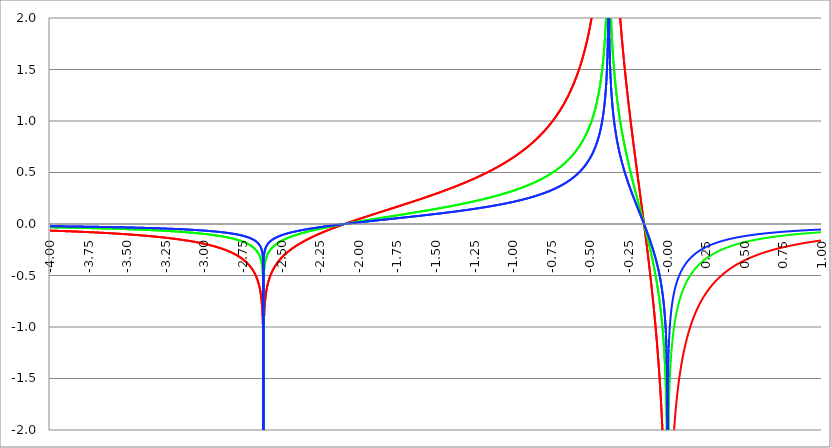
| Category | Series 1 | Series 0 | Series 2 |
|---|---|---|---|
| -4.0 | -0.064 | -0.032 | -0.021 |
| -3.9975 | -0.064 | -0.032 | -0.021 |
| -3.995 | -0.064 | -0.032 | -0.021 |
| -3.9925 | -0.064 | -0.032 | -0.021 |
| -3.99 | -0.065 | -0.032 | -0.022 |
| -3.9875 | -0.065 | -0.032 | -0.022 |
| -3.985 | -0.065 | -0.032 | -0.022 |
| -3.9825 | -0.065 | -0.032 | -0.022 |
| -3.98 | -0.065 | -0.033 | -0.022 |
| -3.9775 | -0.065 | -0.033 | -0.022 |
| -3.975000000000001 | -0.065 | -0.033 | -0.022 |
| -3.972500000000001 | -0.065 | -0.033 | -0.022 |
| -3.970000000000001 | -0.066 | -0.033 | -0.022 |
| -3.967500000000001 | -0.066 | -0.033 | -0.022 |
| -3.965000000000001 | -0.066 | -0.033 | -0.022 |
| -3.962500000000001 | -0.066 | -0.033 | -0.022 |
| -3.960000000000001 | -0.066 | -0.033 | -0.022 |
| -3.957500000000001 | -0.066 | -0.033 | -0.022 |
| -3.955000000000001 | -0.066 | -0.033 | -0.022 |
| -3.952500000000001 | -0.066 | -0.033 | -0.022 |
| -3.950000000000001 | -0.067 | -0.033 | -0.022 |
| -3.947500000000001 | -0.067 | -0.033 | -0.022 |
| -3.945000000000001 | -0.067 | -0.033 | -0.022 |
| -3.942500000000001 | -0.067 | -0.034 | -0.022 |
| -3.940000000000001 | -0.067 | -0.034 | -0.022 |
| -3.937500000000001 | -0.067 | -0.034 | -0.022 |
| -3.935000000000001 | -0.067 | -0.034 | -0.022 |
| -3.932500000000001 | -0.068 | -0.034 | -0.023 |
| -3.930000000000001 | -0.068 | -0.034 | -0.023 |
| -3.927500000000002 | -0.068 | -0.034 | -0.023 |
| -3.925000000000002 | -0.068 | -0.034 | -0.023 |
| -3.922500000000002 | -0.068 | -0.034 | -0.023 |
| -3.920000000000002 | -0.068 | -0.034 | -0.023 |
| -3.917500000000002 | -0.068 | -0.034 | -0.023 |
| -3.915000000000002 | -0.069 | -0.034 | -0.023 |
| -3.912500000000002 | -0.069 | -0.034 | -0.023 |
| -3.910000000000002 | -0.069 | -0.034 | -0.023 |
| -3.907500000000002 | -0.069 | -0.034 | -0.023 |
| -3.905000000000002 | -0.069 | -0.035 | -0.023 |
| -3.902500000000002 | -0.069 | -0.035 | -0.023 |
| -3.900000000000002 | -0.069 | -0.035 | -0.023 |
| -3.897500000000002 | -0.07 | -0.035 | -0.023 |
| -3.895000000000002 | -0.07 | -0.035 | -0.023 |
| -3.892500000000002 | -0.07 | -0.035 | -0.023 |
| -3.890000000000002 | -0.07 | -0.035 | -0.023 |
| -3.887500000000002 | -0.07 | -0.035 | -0.023 |
| -3.885000000000002 | -0.07 | -0.035 | -0.023 |
| -3.882500000000002 | -0.07 | -0.035 | -0.023 |
| -3.880000000000002 | -0.071 | -0.035 | -0.024 |
| -3.877500000000003 | -0.071 | -0.035 | -0.024 |
| -3.875000000000003 | -0.071 | -0.035 | -0.024 |
| -3.872500000000003 | -0.071 | -0.035 | -0.024 |
| -3.870000000000003 | -0.071 | -0.036 | -0.024 |
| -3.867500000000003 | -0.071 | -0.036 | -0.024 |
| -3.865000000000003 | -0.071 | -0.036 | -0.024 |
| -3.862500000000003 | -0.072 | -0.036 | -0.024 |
| -3.860000000000003 | -0.072 | -0.036 | -0.024 |
| -3.857500000000003 | -0.072 | -0.036 | -0.024 |
| -3.855000000000003 | -0.072 | -0.036 | -0.024 |
| -3.852500000000003 | -0.072 | -0.036 | -0.024 |
| -3.850000000000003 | -0.072 | -0.036 | -0.024 |
| -3.847500000000003 | -0.072 | -0.036 | -0.024 |
| -3.845000000000003 | -0.073 | -0.036 | -0.024 |
| -3.842500000000003 | -0.073 | -0.036 | -0.024 |
| -3.840000000000003 | -0.073 | -0.036 | -0.024 |
| -3.837500000000003 | -0.073 | -0.037 | -0.024 |
| -3.835000000000003 | -0.073 | -0.037 | -0.024 |
| -3.832500000000004 | -0.073 | -0.037 | -0.024 |
| -3.830000000000004 | -0.074 | -0.037 | -0.025 |
| -3.827500000000004 | -0.074 | -0.037 | -0.025 |
| -3.825000000000004 | -0.074 | -0.037 | -0.025 |
| -3.822500000000004 | -0.074 | -0.037 | -0.025 |
| -3.820000000000004 | -0.074 | -0.037 | -0.025 |
| -3.817500000000004 | -0.074 | -0.037 | -0.025 |
| -3.815000000000004 | -0.074 | -0.037 | -0.025 |
| -3.812500000000004 | -0.075 | -0.037 | -0.025 |
| -3.810000000000004 | -0.075 | -0.037 | -0.025 |
| -3.807500000000004 | -0.075 | -0.037 | -0.025 |
| -3.805000000000004 | -0.075 | -0.038 | -0.025 |
| -3.802500000000004 | -0.075 | -0.038 | -0.025 |
| -3.800000000000004 | -0.075 | -0.038 | -0.025 |
| -3.797500000000004 | -0.076 | -0.038 | -0.025 |
| -3.795000000000004 | -0.076 | -0.038 | -0.025 |
| -3.792500000000004 | -0.076 | -0.038 | -0.025 |
| -3.790000000000004 | -0.076 | -0.038 | -0.025 |
| -3.787500000000004 | -0.076 | -0.038 | -0.025 |
| -3.785000000000004 | -0.076 | -0.038 | -0.025 |
| -3.782500000000005 | -0.077 | -0.038 | -0.026 |
| -3.780000000000005 | -0.077 | -0.038 | -0.026 |
| -3.777500000000005 | -0.077 | -0.038 | -0.026 |
| -3.775000000000005 | -0.077 | -0.039 | -0.026 |
| -3.772500000000005 | -0.077 | -0.039 | -0.026 |
| -3.770000000000005 | -0.077 | -0.039 | -0.026 |
| -3.767500000000005 | -0.078 | -0.039 | -0.026 |
| -3.765000000000005 | -0.078 | -0.039 | -0.026 |
| -3.762500000000005 | -0.078 | -0.039 | -0.026 |
| -3.760000000000005 | -0.078 | -0.039 | -0.026 |
| -3.757500000000005 | -0.078 | -0.039 | -0.026 |
| -3.755000000000005 | -0.078 | -0.039 | -0.026 |
| -3.752500000000005 | -0.079 | -0.039 | -0.026 |
| -3.750000000000005 | -0.079 | -0.039 | -0.026 |
| -3.747500000000005 | -0.079 | -0.04 | -0.026 |
| -3.745000000000005 | -0.079 | -0.04 | -0.026 |
| -3.742500000000005 | -0.079 | -0.04 | -0.026 |
| -3.740000000000005 | -0.08 | -0.04 | -0.027 |
| -3.737500000000006 | -0.08 | -0.04 | -0.027 |
| -3.735000000000006 | -0.08 | -0.04 | -0.027 |
| -3.732500000000006 | -0.08 | -0.04 | -0.027 |
| -3.730000000000006 | -0.08 | -0.04 | -0.027 |
| -3.727500000000006 | -0.08 | -0.04 | -0.027 |
| -3.725000000000006 | -0.081 | -0.04 | -0.027 |
| -3.722500000000006 | -0.081 | -0.04 | -0.027 |
| -3.720000000000006 | -0.081 | -0.04 | -0.027 |
| -3.717500000000006 | -0.081 | -0.041 | -0.027 |
| -3.715000000000006 | -0.081 | -0.041 | -0.027 |
| -3.712500000000006 | -0.082 | -0.041 | -0.027 |
| -3.710000000000006 | -0.082 | -0.041 | -0.027 |
| -3.707500000000006 | -0.082 | -0.041 | -0.027 |
| -3.705000000000006 | -0.082 | -0.041 | -0.027 |
| -3.702500000000006 | -0.082 | -0.041 | -0.027 |
| -3.700000000000006 | -0.082 | -0.041 | -0.027 |
| -3.697500000000006 | -0.083 | -0.041 | -0.028 |
| -3.695000000000006 | -0.083 | -0.041 | -0.028 |
| -3.692500000000006 | -0.083 | -0.042 | -0.028 |
| -3.690000000000006 | -0.083 | -0.042 | -0.028 |
| -3.687500000000006 | -0.083 | -0.042 | -0.028 |
| -3.685000000000007 | -0.084 | -0.042 | -0.028 |
| -3.682500000000007 | -0.084 | -0.042 | -0.028 |
| -3.680000000000007 | -0.084 | -0.042 | -0.028 |
| -3.677500000000007 | -0.084 | -0.042 | -0.028 |
| -3.675000000000007 | -0.084 | -0.042 | -0.028 |
| -3.672500000000007 | -0.085 | -0.042 | -0.028 |
| -3.670000000000007 | -0.085 | -0.042 | -0.028 |
| -3.667500000000007 | -0.085 | -0.042 | -0.028 |
| -3.665000000000007 | -0.085 | -0.043 | -0.028 |
| -3.662500000000007 | -0.085 | -0.043 | -0.028 |
| -3.660000000000007 | -0.086 | -0.043 | -0.029 |
| -3.657500000000007 | -0.086 | -0.043 | -0.029 |
| -3.655000000000007 | -0.086 | -0.043 | -0.029 |
| -3.652500000000007 | -0.086 | -0.043 | -0.029 |
| -3.650000000000007 | -0.086 | -0.043 | -0.029 |
| -3.647500000000007 | -0.087 | -0.043 | -0.029 |
| -3.645000000000007 | -0.087 | -0.043 | -0.029 |
| -3.642500000000008 | -0.087 | -0.043 | -0.029 |
| -3.640000000000008 | -0.087 | -0.044 | -0.029 |
| -3.637500000000008 | -0.087 | -0.044 | -0.029 |
| -3.635000000000008 | -0.088 | -0.044 | -0.029 |
| -3.632500000000008 | -0.088 | -0.044 | -0.029 |
| -3.630000000000008 | -0.088 | -0.044 | -0.029 |
| -3.627500000000008 | -0.088 | -0.044 | -0.029 |
| -3.625000000000008 | -0.088 | -0.044 | -0.029 |
| -3.622500000000008 | -0.089 | -0.044 | -0.03 |
| -3.620000000000008 | -0.089 | -0.044 | -0.03 |
| -3.617500000000008 | -0.089 | -0.045 | -0.03 |
| -3.615000000000008 | -0.089 | -0.045 | -0.03 |
| -3.612500000000008 | -0.09 | -0.045 | -0.03 |
| -3.610000000000008 | -0.09 | -0.045 | -0.03 |
| -3.607500000000008 | -0.09 | -0.045 | -0.03 |
| -3.605000000000008 | -0.09 | -0.045 | -0.03 |
| -3.602500000000008 | -0.09 | -0.045 | -0.03 |
| -3.600000000000008 | -0.091 | -0.045 | -0.03 |
| -3.597500000000009 | -0.091 | -0.045 | -0.03 |
| -3.595000000000009 | -0.091 | -0.046 | -0.03 |
| -3.592500000000009 | -0.091 | -0.046 | -0.03 |
| -3.590000000000009 | -0.091 | -0.046 | -0.03 |
| -3.587500000000009 | -0.092 | -0.046 | -0.031 |
| -3.585000000000009 | -0.092 | -0.046 | -0.031 |
| -3.582500000000009 | -0.092 | -0.046 | -0.031 |
| -3.580000000000009 | -0.092 | -0.046 | -0.031 |
| -3.577500000000009 | -0.093 | -0.046 | -0.031 |
| -3.575000000000009 | -0.093 | -0.046 | -0.031 |
| -3.572500000000009 | -0.093 | -0.047 | -0.031 |
| -3.570000000000009 | -0.093 | -0.047 | -0.031 |
| -3.56750000000001 | -0.094 | -0.047 | -0.031 |
| -3.565000000000009 | -0.094 | -0.047 | -0.031 |
| -3.562500000000009 | -0.094 | -0.047 | -0.031 |
| -3.560000000000009 | -0.094 | -0.047 | -0.031 |
| -3.557500000000009 | -0.094 | -0.047 | -0.031 |
| -3.555000000000009 | -0.095 | -0.047 | -0.032 |
| -3.55250000000001 | -0.095 | -0.047 | -0.032 |
| -3.55000000000001 | -0.095 | -0.048 | -0.032 |
| -3.54750000000001 | -0.095 | -0.048 | -0.032 |
| -3.54500000000001 | -0.096 | -0.048 | -0.032 |
| -3.54250000000001 | -0.096 | -0.048 | -0.032 |
| -3.54000000000001 | -0.096 | -0.048 | -0.032 |
| -3.53750000000001 | -0.096 | -0.048 | -0.032 |
| -3.53500000000001 | -0.097 | -0.048 | -0.032 |
| -3.53250000000001 | -0.097 | -0.048 | -0.032 |
| -3.53000000000001 | -0.097 | -0.049 | -0.032 |
| -3.52750000000001 | -0.097 | -0.049 | -0.032 |
| -3.52500000000001 | -0.098 | -0.049 | -0.033 |
| -3.52250000000001 | -0.098 | -0.049 | -0.033 |
| -3.52000000000001 | -0.098 | -0.049 | -0.033 |
| -3.51750000000001 | -0.098 | -0.049 | -0.033 |
| -3.51500000000001 | -0.099 | -0.049 | -0.033 |
| -3.51250000000001 | -0.099 | -0.049 | -0.033 |
| -3.51000000000001 | -0.099 | -0.05 | -0.033 |
| -3.50750000000001 | -0.099 | -0.05 | -0.033 |
| -3.505000000000011 | -0.1 | -0.05 | -0.033 |
| -3.502500000000011 | -0.1 | -0.05 | -0.033 |
| -3.500000000000011 | -0.1 | -0.05 | -0.033 |
| -3.497500000000011 | -0.1 | -0.05 | -0.033 |
| -3.495000000000011 | -0.101 | -0.05 | -0.034 |
| -3.492500000000011 | -0.101 | -0.05 | -0.034 |
| -3.490000000000011 | -0.101 | -0.051 | -0.034 |
| -3.487500000000011 | -0.101 | -0.051 | -0.034 |
| -3.485000000000011 | -0.102 | -0.051 | -0.034 |
| -3.482500000000011 | -0.102 | -0.051 | -0.034 |
| -3.480000000000011 | -0.102 | -0.051 | -0.034 |
| -3.477500000000011 | -0.103 | -0.051 | -0.034 |
| -3.475000000000011 | -0.103 | -0.051 | -0.034 |
| -3.472500000000011 | -0.103 | -0.052 | -0.034 |
| -3.470000000000011 | -0.103 | -0.052 | -0.034 |
| -3.467500000000011 | -0.104 | -0.052 | -0.035 |
| -3.465000000000011 | -0.104 | -0.052 | -0.035 |
| -3.462500000000011 | -0.104 | -0.052 | -0.035 |
| -3.460000000000011 | -0.104 | -0.052 | -0.035 |
| -3.457500000000012 | -0.105 | -0.052 | -0.035 |
| -3.455000000000012 | -0.105 | -0.053 | -0.035 |
| -3.452500000000012 | -0.105 | -0.053 | -0.035 |
| -3.450000000000012 | -0.106 | -0.053 | -0.035 |
| -3.447500000000012 | -0.106 | -0.053 | -0.035 |
| -3.445000000000012 | -0.106 | -0.053 | -0.035 |
| -3.442500000000012 | -0.106 | -0.053 | -0.035 |
| -3.440000000000012 | -0.107 | -0.053 | -0.036 |
| -3.437500000000012 | -0.107 | -0.054 | -0.036 |
| -3.435000000000012 | -0.107 | -0.054 | -0.036 |
| -3.432500000000012 | -0.108 | -0.054 | -0.036 |
| -3.430000000000012 | -0.108 | -0.054 | -0.036 |
| -3.427500000000012 | -0.108 | -0.054 | -0.036 |
| -3.425000000000012 | -0.108 | -0.054 | -0.036 |
| -3.422500000000012 | -0.109 | -0.054 | -0.036 |
| -3.420000000000012 | -0.109 | -0.055 | -0.036 |
| -3.417500000000012 | -0.109 | -0.055 | -0.036 |
| -3.415000000000012 | -0.11 | -0.055 | -0.037 |
| -3.412500000000012 | -0.11 | -0.055 | -0.037 |
| -3.410000000000013 | -0.11 | -0.055 | -0.037 |
| -3.407500000000012 | -0.111 | -0.055 | -0.037 |
| -3.405000000000013 | -0.111 | -0.055 | -0.037 |
| -3.402500000000013 | -0.111 | -0.056 | -0.037 |
| -3.400000000000013 | -0.112 | -0.056 | -0.037 |
| -3.397500000000013 | -0.112 | -0.056 | -0.037 |
| -3.395000000000013 | -0.112 | -0.056 | -0.037 |
| -3.392500000000013 | -0.112 | -0.056 | -0.037 |
| -3.390000000000013 | -0.113 | -0.056 | -0.038 |
| -3.387500000000013 | -0.113 | -0.057 | -0.038 |
| -3.385000000000013 | -0.113 | -0.057 | -0.038 |
| -3.382500000000013 | -0.114 | -0.057 | -0.038 |
| -3.380000000000013 | -0.114 | -0.057 | -0.038 |
| -3.377500000000013 | -0.114 | -0.057 | -0.038 |
| -3.375000000000013 | -0.115 | -0.057 | -0.038 |
| -3.372500000000013 | -0.115 | -0.058 | -0.038 |
| -3.370000000000013 | -0.115 | -0.058 | -0.038 |
| -3.367500000000013 | -0.116 | -0.058 | -0.039 |
| -3.365000000000013 | -0.116 | -0.058 | -0.039 |
| -3.362500000000014 | -0.116 | -0.058 | -0.039 |
| -3.360000000000014 | -0.117 | -0.058 | -0.039 |
| -3.357500000000014 | -0.117 | -0.059 | -0.039 |
| -3.355000000000014 | -0.117 | -0.059 | -0.039 |
| -3.352500000000014 | -0.118 | -0.059 | -0.039 |
| -3.350000000000014 | -0.118 | -0.059 | -0.039 |
| -3.347500000000014 | -0.118 | -0.059 | -0.039 |
| -3.345000000000014 | -0.119 | -0.059 | -0.04 |
| -3.342500000000014 | -0.119 | -0.06 | -0.04 |
| -3.340000000000014 | -0.119 | -0.06 | -0.04 |
| -3.337500000000014 | -0.12 | -0.06 | -0.04 |
| -3.335000000000014 | -0.12 | -0.06 | -0.04 |
| -3.332500000000014 | -0.121 | -0.06 | -0.04 |
| -3.330000000000014 | -0.121 | -0.06 | -0.04 |
| -3.327500000000014 | -0.121 | -0.061 | -0.04 |
| -3.325000000000014 | -0.122 | -0.061 | -0.041 |
| -3.322500000000014 | -0.122 | -0.061 | -0.041 |
| -3.320000000000014 | -0.122 | -0.061 | -0.041 |
| -3.317500000000015 | -0.123 | -0.061 | -0.041 |
| -3.315000000000015 | -0.123 | -0.062 | -0.041 |
| -3.312500000000015 | -0.123 | -0.062 | -0.041 |
| -3.310000000000015 | -0.124 | -0.062 | -0.041 |
| -3.307500000000015 | -0.124 | -0.062 | -0.041 |
| -3.305000000000015 | -0.125 | -0.062 | -0.042 |
| -3.302500000000015 | -0.125 | -0.062 | -0.042 |
| -3.300000000000015 | -0.125 | -0.063 | -0.042 |
| -3.297500000000015 | -0.126 | -0.063 | -0.042 |
| -3.295000000000015 | -0.126 | -0.063 | -0.042 |
| -3.292500000000015 | -0.126 | -0.063 | -0.042 |
| -3.290000000000015 | -0.127 | -0.063 | -0.042 |
| -3.287500000000015 | -0.127 | -0.064 | -0.042 |
| -3.285000000000015 | -0.128 | -0.064 | -0.043 |
| -3.282500000000015 | -0.128 | -0.064 | -0.043 |
| -3.280000000000015 | -0.128 | -0.064 | -0.043 |
| -3.277500000000015 | -0.129 | -0.064 | -0.043 |
| -3.275000000000015 | -0.129 | -0.065 | -0.043 |
| -3.272500000000015 | -0.13 | -0.065 | -0.043 |
| -3.270000000000016 | -0.13 | -0.065 | -0.043 |
| -3.267500000000015 | -0.13 | -0.065 | -0.043 |
| -3.265000000000016 | -0.131 | -0.065 | -0.044 |
| -3.262500000000016 | -0.131 | -0.066 | -0.044 |
| -3.260000000000016 | -0.132 | -0.066 | -0.044 |
| -3.257500000000016 | -0.132 | -0.066 | -0.044 |
| -3.255000000000016 | -0.133 | -0.066 | -0.044 |
| -3.252500000000016 | -0.133 | -0.066 | -0.044 |
| -3.250000000000016 | -0.133 | -0.067 | -0.044 |
| -3.247500000000016 | -0.134 | -0.067 | -0.045 |
| -3.245000000000016 | -0.134 | -0.067 | -0.045 |
| -3.242500000000016 | -0.135 | -0.067 | -0.045 |
| -3.240000000000016 | -0.135 | -0.068 | -0.045 |
| -3.237500000000016 | -0.135 | -0.068 | -0.045 |
| -3.235000000000016 | -0.136 | -0.068 | -0.045 |
| -3.232500000000016 | -0.136 | -0.068 | -0.045 |
| -3.230000000000016 | -0.137 | -0.068 | -0.046 |
| -3.227500000000016 | -0.137 | -0.069 | -0.046 |
| -3.225000000000016 | -0.138 | -0.069 | -0.046 |
| -3.222500000000016 | -0.138 | -0.069 | -0.046 |
| -3.220000000000016 | -0.139 | -0.069 | -0.046 |
| -3.217500000000016 | -0.139 | -0.07 | -0.046 |
| -3.215000000000017 | -0.14 | -0.07 | -0.047 |
| -3.212500000000017 | -0.14 | -0.07 | -0.047 |
| -3.210000000000017 | -0.14 | -0.07 | -0.047 |
| -3.207500000000016 | -0.141 | -0.07 | -0.047 |
| -3.205000000000017 | -0.141 | -0.071 | -0.047 |
| -3.202500000000017 | -0.142 | -0.071 | -0.047 |
| -3.200000000000017 | -0.142 | -0.071 | -0.047 |
| -3.197500000000017 | -0.143 | -0.071 | -0.048 |
| -3.195000000000017 | -0.143 | -0.072 | -0.048 |
| -3.192500000000017 | -0.144 | -0.072 | -0.048 |
| -3.190000000000017 | -0.144 | -0.072 | -0.048 |
| -3.187500000000017 | -0.145 | -0.072 | -0.048 |
| -3.185000000000017 | -0.145 | -0.073 | -0.048 |
| -3.182500000000017 | -0.146 | -0.073 | -0.049 |
| -3.180000000000017 | -0.146 | -0.073 | -0.049 |
| -3.177500000000017 | -0.147 | -0.073 | -0.049 |
| -3.175000000000018 | -0.147 | -0.074 | -0.049 |
| -3.172500000000018 | -0.148 | -0.074 | -0.049 |
| -3.170000000000018 | -0.148 | -0.074 | -0.049 |
| -3.167500000000017 | -0.149 | -0.074 | -0.05 |
| -3.165000000000018 | -0.149 | -0.075 | -0.05 |
| -3.162500000000018 | -0.15 | -0.075 | -0.05 |
| -3.160000000000018 | -0.15 | -0.075 | -0.05 |
| -3.157500000000018 | -0.151 | -0.075 | -0.05 |
| -3.155000000000018 | -0.151 | -0.076 | -0.05 |
| -3.152500000000018 | -0.152 | -0.076 | -0.051 |
| -3.150000000000018 | -0.152 | -0.076 | -0.051 |
| -3.147500000000018 | -0.153 | -0.077 | -0.051 |
| -3.145000000000018 | -0.154 | -0.077 | -0.051 |
| -3.142500000000018 | -0.154 | -0.077 | -0.051 |
| -3.140000000000018 | -0.155 | -0.077 | -0.052 |
| -3.137500000000018 | -0.155 | -0.078 | -0.052 |
| -3.135000000000018 | -0.156 | -0.078 | -0.052 |
| -3.132500000000018 | -0.156 | -0.078 | -0.052 |
| -3.130000000000019 | -0.157 | -0.078 | -0.052 |
| -3.127500000000018 | -0.157 | -0.079 | -0.052 |
| -3.125000000000019 | -0.158 | -0.079 | -0.053 |
| -3.122500000000019 | -0.159 | -0.079 | -0.053 |
| -3.120000000000019 | -0.159 | -0.08 | -0.053 |
| -3.117500000000019 | -0.16 | -0.08 | -0.053 |
| -3.115000000000019 | -0.16 | -0.08 | -0.053 |
| -3.112500000000019 | -0.161 | -0.08 | -0.054 |
| -3.110000000000019 | -0.162 | -0.081 | -0.054 |
| -3.10750000000002 | -0.162 | -0.081 | -0.054 |
| -3.10500000000002 | -0.163 | -0.081 | -0.054 |
| -3.10250000000002 | -0.163 | -0.082 | -0.054 |
| -3.10000000000002 | -0.164 | -0.082 | -0.055 |
| -3.09750000000002 | -0.165 | -0.082 | -0.055 |
| -3.095000000000019 | -0.165 | -0.083 | -0.055 |
| -3.092500000000019 | -0.166 | -0.083 | -0.055 |
| -3.090000000000019 | -0.166 | -0.083 | -0.055 |
| -3.08750000000002 | -0.167 | -0.084 | -0.056 |
| -3.085000000000019 | -0.168 | -0.084 | -0.056 |
| -3.08250000000002 | -0.168 | -0.084 | -0.056 |
| -3.08000000000002 | -0.169 | -0.085 | -0.056 |
| -3.07750000000002 | -0.17 | -0.085 | -0.057 |
| -3.07500000000002 | -0.17 | -0.085 | -0.057 |
| -3.07250000000002 | -0.171 | -0.086 | -0.057 |
| -3.07000000000002 | -0.172 | -0.086 | -0.057 |
| -3.06750000000002 | -0.172 | -0.086 | -0.057 |
| -3.06500000000002 | -0.173 | -0.087 | -0.058 |
| -3.06250000000002 | -0.174 | -0.087 | -0.058 |
| -3.06000000000002 | -0.174 | -0.087 | -0.058 |
| -3.05750000000002 | -0.175 | -0.088 | -0.058 |
| -3.05500000000002 | -0.176 | -0.088 | -0.059 |
| -3.05250000000002 | -0.177 | -0.088 | -0.059 |
| -3.05000000000002 | -0.177 | -0.089 | -0.059 |
| -3.04750000000002 | -0.178 | -0.089 | -0.059 |
| -3.04500000000002 | -0.179 | -0.089 | -0.06 |
| -3.04250000000002 | -0.179 | -0.09 | -0.06 |
| -3.04000000000002 | -0.18 | -0.09 | -0.06 |
| -3.037500000000021 | -0.181 | -0.09 | -0.06 |
| -3.035000000000021 | -0.182 | -0.091 | -0.061 |
| -3.032500000000021 | -0.182 | -0.091 | -0.061 |
| -3.030000000000021 | -0.183 | -0.092 | -0.061 |
| -3.027500000000021 | -0.184 | -0.092 | -0.061 |
| -3.025000000000021 | -0.185 | -0.092 | -0.062 |
| -3.022500000000021 | -0.185 | -0.093 | -0.062 |
| -3.020000000000021 | -0.186 | -0.093 | -0.062 |
| -3.017500000000021 | -0.187 | -0.093 | -0.062 |
| -3.015000000000021 | -0.188 | -0.094 | -0.063 |
| -3.012500000000021 | -0.189 | -0.094 | -0.063 |
| -3.010000000000021 | -0.189 | -0.095 | -0.063 |
| -3.007500000000021 | -0.19 | -0.095 | -0.063 |
| -3.005000000000021 | -0.191 | -0.095 | -0.064 |
| -3.002500000000021 | -0.192 | -0.096 | -0.064 |
| -3.000000000000021 | -0.193 | -0.096 | -0.064 |
| -2.997500000000021 | -0.193 | -0.097 | -0.064 |
| -2.995000000000021 | -0.194 | -0.097 | -0.065 |
| -2.992500000000021 | -0.195 | -0.098 | -0.065 |
| -2.990000000000021 | -0.196 | -0.098 | -0.065 |
| -2.987500000000022 | -0.197 | -0.098 | -0.066 |
| -2.985000000000022 | -0.198 | -0.099 | -0.066 |
| -2.982500000000022 | -0.199 | -0.099 | -0.066 |
| -2.980000000000022 | -0.2 | -0.1 | -0.067 |
| -2.977500000000022 | -0.2 | -0.1 | -0.067 |
| -2.975000000000022 | -0.201 | -0.101 | -0.067 |
| -2.972500000000022 | -0.202 | -0.101 | -0.067 |
| -2.970000000000022 | -0.203 | -0.102 | -0.068 |
| -2.967500000000022 | -0.204 | -0.102 | -0.068 |
| -2.965000000000022 | -0.205 | -0.103 | -0.068 |
| -2.962500000000022 | -0.206 | -0.103 | -0.069 |
| -2.960000000000022 | -0.207 | -0.103 | -0.069 |
| -2.957500000000022 | -0.208 | -0.104 | -0.069 |
| -2.955000000000022 | -0.209 | -0.104 | -0.07 |
| -2.952500000000022 | -0.21 | -0.105 | -0.07 |
| -2.950000000000022 | -0.211 | -0.105 | -0.07 |
| -2.947500000000022 | -0.212 | -0.106 | -0.071 |
| -2.945000000000022 | -0.213 | -0.106 | -0.071 |
| -2.942500000000023 | -0.214 | -0.107 | -0.071 |
| -2.940000000000023 | -0.215 | -0.107 | -0.072 |
| -2.937500000000023 | -0.216 | -0.108 | -0.072 |
| -2.935000000000023 | -0.217 | -0.108 | -0.072 |
| -2.932500000000023 | -0.218 | -0.109 | -0.073 |
| -2.930000000000023 | -0.219 | -0.11 | -0.073 |
| -2.927500000000023 | -0.22 | -0.11 | -0.073 |
| -2.925000000000023 | -0.221 | -0.111 | -0.074 |
| -2.922500000000023 | -0.222 | -0.111 | -0.074 |
| -2.920000000000023 | -0.223 | -0.112 | -0.074 |
| -2.917500000000023 | -0.225 | -0.112 | -0.075 |
| -2.915000000000023 | -0.226 | -0.113 | -0.075 |
| -2.912500000000023 | -0.227 | -0.113 | -0.076 |
| -2.910000000000023 | -0.228 | -0.114 | -0.076 |
| -2.907500000000023 | -0.229 | -0.115 | -0.076 |
| -2.905000000000023 | -0.23 | -0.115 | -0.077 |
| -2.902500000000023 | -0.232 | -0.116 | -0.077 |
| -2.900000000000023 | -0.233 | -0.116 | -0.078 |
| -2.897500000000023 | -0.234 | -0.117 | -0.078 |
| -2.895000000000023 | -0.235 | -0.118 | -0.078 |
| -2.892500000000024 | -0.236 | -0.118 | -0.079 |
| -2.890000000000024 | -0.238 | -0.119 | -0.079 |
| -2.887500000000024 | -0.239 | -0.12 | -0.08 |
| -2.885000000000024 | -0.24 | -0.12 | -0.08 |
| -2.882500000000024 | -0.242 | -0.121 | -0.081 |
| -2.880000000000024 | -0.243 | -0.121 | -0.081 |
| -2.877500000000024 | -0.244 | -0.122 | -0.081 |
| -2.875000000000024 | -0.246 | -0.123 | -0.082 |
| -2.872500000000024 | -0.247 | -0.123 | -0.082 |
| -2.870000000000024 | -0.248 | -0.124 | -0.083 |
| -2.867500000000024 | -0.25 | -0.125 | -0.083 |
| -2.865000000000024 | -0.251 | -0.126 | -0.084 |
| -2.862500000000024 | -0.253 | -0.126 | -0.084 |
| -2.860000000000024 | -0.254 | -0.127 | -0.085 |
| -2.857500000000024 | -0.256 | -0.128 | -0.085 |
| -2.855000000000024 | -0.257 | -0.128 | -0.086 |
| -2.852500000000024 | -0.258 | -0.129 | -0.086 |
| -2.850000000000024 | -0.26 | -0.13 | -0.087 |
| -2.847500000000025 | -0.262 | -0.131 | -0.087 |
| -2.845000000000025 | -0.263 | -0.132 | -0.088 |
| -2.842500000000025 | -0.265 | -0.132 | -0.088 |
| -2.840000000000025 | -0.266 | -0.133 | -0.089 |
| -2.837500000000025 | -0.268 | -0.134 | -0.089 |
| -2.835000000000025 | -0.27 | -0.135 | -0.09 |
| -2.832500000000025 | -0.271 | -0.136 | -0.09 |
| -2.830000000000025 | -0.273 | -0.136 | -0.091 |
| -2.827500000000025 | -0.275 | -0.137 | -0.092 |
| -2.825000000000025 | -0.276 | -0.138 | -0.092 |
| -2.822500000000025 | -0.278 | -0.139 | -0.093 |
| -2.820000000000025 | -0.28 | -0.14 | -0.093 |
| -2.817500000000025 | -0.282 | -0.141 | -0.094 |
| -2.815000000000025 | -0.284 | -0.142 | -0.095 |
| -2.812500000000025 | -0.285 | -0.143 | -0.095 |
| -2.810000000000025 | -0.287 | -0.144 | -0.096 |
| -2.807500000000025 | -0.289 | -0.145 | -0.096 |
| -2.805000000000025 | -0.291 | -0.146 | -0.097 |
| -2.802500000000025 | -0.293 | -0.147 | -0.098 |
| -2.800000000000026 | -0.295 | -0.148 | -0.098 |
| -2.797500000000026 | -0.297 | -0.149 | -0.099 |
| -2.795000000000026 | -0.299 | -0.15 | -0.1 |
| -2.792500000000026 | -0.301 | -0.151 | -0.1 |
| -2.790000000000026 | -0.304 | -0.152 | -0.101 |
| -2.787500000000026 | -0.306 | -0.153 | -0.102 |
| -2.785000000000026 | -0.308 | -0.154 | -0.103 |
| -2.782500000000026 | -0.31 | -0.155 | -0.103 |
| -2.780000000000026 | -0.313 | -0.156 | -0.104 |
| -2.777500000000026 | -0.315 | -0.157 | -0.105 |
| -2.775000000000026 | -0.317 | -0.159 | -0.106 |
| -2.772500000000026 | -0.32 | -0.16 | -0.107 |
| -2.770000000000026 | -0.322 | -0.161 | -0.107 |
| -2.767500000000026 | -0.325 | -0.162 | -0.108 |
| -2.765000000000026 | -0.327 | -0.164 | -0.109 |
| -2.762500000000026 | -0.33 | -0.165 | -0.11 |
| -2.760000000000026 | -0.332 | -0.166 | -0.111 |
| -2.757500000000026 | -0.335 | -0.168 | -0.112 |
| -2.755000000000026 | -0.338 | -0.169 | -0.113 |
| -2.752500000000027 | -0.341 | -0.17 | -0.114 |
| -2.750000000000027 | -0.344 | -0.172 | -0.115 |
| -2.747500000000026 | -0.347 | -0.173 | -0.116 |
| -2.745000000000027 | -0.35 | -0.175 | -0.117 |
| -2.742500000000027 | -0.353 | -0.176 | -0.118 |
| -2.740000000000027 | -0.356 | -0.178 | -0.119 |
| -2.737500000000027 | -0.359 | -0.18 | -0.12 |
| -2.735000000000027 | -0.362 | -0.181 | -0.121 |
| -2.732500000000027 | -0.366 | -0.183 | -0.122 |
| -2.730000000000027 | -0.369 | -0.185 | -0.123 |
| -2.727500000000027 | -0.373 | -0.186 | -0.124 |
| -2.725000000000027 | -0.376 | -0.188 | -0.125 |
| -2.722500000000027 | -0.38 | -0.19 | -0.127 |
| -2.720000000000027 | -0.384 | -0.192 | -0.128 |
| -2.717500000000027 | -0.388 | -0.194 | -0.129 |
| -2.715000000000027 | -0.392 | -0.196 | -0.131 |
| -2.712500000000027 | -0.396 | -0.198 | -0.132 |
| -2.710000000000027 | -0.4 | -0.2 | -0.133 |
| -2.707500000000027 | -0.404 | -0.202 | -0.135 |
| -2.705000000000028 | -0.409 | -0.204 | -0.136 |
| -2.702500000000028 | -0.414 | -0.207 | -0.138 |
| -2.700000000000028 | -0.418 | -0.209 | -0.139 |
| -2.697500000000028 | -0.423 | -0.212 | -0.141 |
| -2.695000000000028 | -0.428 | -0.214 | -0.143 |
| -2.692500000000028 | -0.434 | -0.217 | -0.145 |
| -2.690000000000028 | -0.439 | -0.22 | -0.146 |
| -2.687500000000028 | -0.445 | -0.222 | -0.148 |
| -2.685000000000028 | -0.451 | -0.225 | -0.15 |
| -2.682500000000028 | -0.457 | -0.229 | -0.152 |
| -2.680000000000028 | -0.463 | -0.232 | -0.154 |
| -2.677500000000028 | -0.47 | -0.235 | -0.157 |
| -2.675000000000028 | -0.477 | -0.239 | -0.159 |
| -2.672500000000028 | -0.484 | -0.242 | -0.161 |
| -2.670000000000028 | -0.492 | -0.246 | -0.164 |
| -2.667500000000028 | -0.5 | -0.25 | -0.167 |
| -2.665000000000028 | -0.509 | -0.254 | -0.17 |
| -2.662500000000028 | -0.518 | -0.259 | -0.173 |
| -2.660000000000028 | -0.527 | -0.264 | -0.176 |
| -2.657500000000029 | -0.537 | -0.269 | -0.179 |
| -2.655000000000029 | -0.548 | -0.274 | -0.183 |
| -2.652500000000029 | -0.56 | -0.28 | -0.187 |
| -2.650000000000029 | -0.572 | -0.286 | -0.191 |
| -2.647500000000029 | -0.586 | -0.293 | -0.195 |
| -2.645000000000029 | -0.601 | -0.3 | -0.2 |
| -2.642500000000029 | -0.617 | -0.309 | -0.206 |
| -2.640000000000029 | -0.635 | -0.318 | -0.212 |
| -2.637500000000029 | -0.655 | -0.328 | -0.218 |
| -2.635000000000029 | -0.679 | -0.339 | -0.226 |
| -2.632500000000029 | -0.705 | -0.353 | -0.235 |
| -2.630000000000029 | -0.737 | -0.369 | -0.246 |
| -2.62750000000003 | -0.777 | -0.389 | -0.259 |
| -2.625000000000029 | -0.829 | -0.415 | -0.276 |
| -2.622500000000029 | -0.905 | -0.452 | -0.302 |
| -2.620000000000029 | -1.045 | -0.522 | -0.348 |
| -2.617500000000029 | -5 | -5 | -5 |
| -2.615000000000029 | -0.97 | -0.485 | -0.323 |
| -2.612500000000029 | -0.867 | -0.433 | -0.289 |
| -2.61000000000003 | -0.803 | -0.401 | -0.268 |
| -2.60750000000003 | -0.756 | -0.378 | -0.252 |
| -2.60500000000003 | -0.719 | -0.36 | -0.24 |
| -2.60250000000003 | -0.689 | -0.344 | -0.23 |
| -2.60000000000003 | -0.663 | -0.332 | -0.221 |
| -2.59750000000003 | -0.641 | -0.32 | -0.214 |
| -2.59500000000003 | -0.621 | -0.31 | -0.207 |
| -2.59250000000003 | -0.603 | -0.301 | -0.201 |
| -2.59000000000003 | -0.586 | -0.293 | -0.195 |
| -2.58750000000003 | -0.571 | -0.286 | -0.19 |
| -2.58500000000003 | -0.558 | -0.279 | -0.186 |
| -2.58250000000003 | -0.545 | -0.272 | -0.182 |
| -2.58000000000003 | -0.533 | -0.266 | -0.178 |
| -2.57750000000003 | -0.522 | -0.261 | -0.174 |
| -2.57500000000003 | -0.511 | -0.255 | -0.17 |
| -2.57250000000003 | -0.501 | -0.25 | -0.167 |
| -2.57000000000003 | -0.491 | -0.246 | -0.164 |
| -2.56750000000003 | -0.482 | -0.241 | -0.161 |
| -2.565000000000031 | -0.474 | -0.237 | -0.158 |
| -2.562500000000031 | -0.466 | -0.233 | -0.155 |
| -2.560000000000031 | -0.458 | -0.229 | -0.153 |
| -2.557500000000031 | -0.45 | -0.225 | -0.15 |
| -2.555000000000031 | -0.443 | -0.221 | -0.148 |
| -2.552500000000031 | -0.436 | -0.218 | -0.145 |
| -2.550000000000031 | -0.429 | -0.215 | -0.143 |
| -2.547500000000031 | -0.422 | -0.211 | -0.141 |
| -2.545000000000031 | -0.416 | -0.208 | -0.139 |
| -2.542500000000031 | -0.41 | -0.205 | -0.137 |
| -2.540000000000031 | -0.404 | -0.202 | -0.135 |
| -2.537500000000031 | -0.398 | -0.199 | -0.133 |
| -2.535000000000031 | -0.393 | -0.196 | -0.131 |
| -2.532500000000031 | -0.387 | -0.194 | -0.129 |
| -2.530000000000031 | -0.382 | -0.191 | -0.127 |
| -2.527500000000031 | -0.377 | -0.188 | -0.126 |
| -2.525000000000031 | -0.372 | -0.186 | -0.124 |
| -2.522500000000031 | -0.367 | -0.183 | -0.122 |
| -2.520000000000032 | -0.362 | -0.181 | -0.121 |
| -2.517500000000032 | -0.357 | -0.179 | -0.119 |
| -2.515000000000032 | -0.353 | -0.176 | -0.118 |
| -2.512500000000032 | -0.348 | -0.174 | -0.116 |
| -2.510000000000032 | -0.344 | -0.172 | -0.115 |
| -2.507500000000032 | -0.34 | -0.17 | -0.113 |
| -2.505000000000032 | -0.336 | -0.168 | -0.112 |
| -2.502500000000032 | -0.331 | -0.166 | -0.11 |
| -2.500000000000032 | -0.327 | -0.164 | -0.109 |
| -2.497500000000032 | -0.323 | -0.162 | -0.108 |
| -2.495000000000032 | -0.32 | -0.16 | -0.107 |
| -2.492500000000032 | -0.316 | -0.158 | -0.105 |
| -2.490000000000032 | -0.312 | -0.156 | -0.104 |
| -2.487500000000032 | -0.308 | -0.154 | -0.103 |
| -2.485000000000032 | -0.305 | -0.152 | -0.102 |
| -2.482500000000032 | -0.301 | -0.151 | -0.1 |
| -2.480000000000032 | -0.298 | -0.149 | -0.099 |
| -2.477500000000032 | -0.294 | -0.147 | -0.098 |
| -2.475000000000032 | -0.291 | -0.145 | -0.097 |
| -2.472500000000033 | -0.287 | -0.144 | -0.096 |
| -2.470000000000033 | -0.284 | -0.142 | -0.095 |
| -2.467500000000032 | -0.281 | -0.14 | -0.094 |
| -2.465000000000033 | -0.278 | -0.139 | -0.093 |
| -2.462500000000033 | -0.274 | -0.137 | -0.091 |
| -2.460000000000033 | -0.271 | -0.136 | -0.09 |
| -2.457500000000033 | -0.268 | -0.134 | -0.089 |
| -2.455000000000033 | -0.265 | -0.133 | -0.088 |
| -2.452500000000033 | -0.262 | -0.131 | -0.087 |
| -2.450000000000033 | -0.259 | -0.13 | -0.086 |
| -2.447500000000033 | -0.256 | -0.128 | -0.085 |
| -2.445000000000033 | -0.254 | -0.127 | -0.085 |
| -2.442500000000033 | -0.251 | -0.125 | -0.084 |
| -2.440000000000033 | -0.248 | -0.124 | -0.083 |
| -2.437500000000033 | -0.245 | -0.123 | -0.082 |
| -2.435000000000033 | -0.242 | -0.121 | -0.081 |
| -2.432500000000033 | -0.24 | -0.12 | -0.08 |
| -2.430000000000033 | -0.237 | -0.118 | -0.079 |
| -2.427500000000033 | -0.234 | -0.117 | -0.078 |
| -2.425000000000034 | -0.232 | -0.116 | -0.077 |
| -2.422500000000034 | -0.229 | -0.115 | -0.076 |
| -2.420000000000034 | -0.226 | -0.113 | -0.075 |
| -2.417500000000034 | -0.224 | -0.112 | -0.075 |
| -2.415000000000034 | -0.221 | -0.111 | -0.074 |
| -2.412500000000034 | -0.219 | -0.109 | -0.073 |
| -2.410000000000034 | -0.216 | -0.108 | -0.072 |
| -2.407500000000034 | -0.214 | -0.107 | -0.071 |
| -2.405000000000034 | -0.212 | -0.106 | -0.071 |
| -2.402500000000034 | -0.209 | -0.105 | -0.07 |
| -2.400000000000034 | -0.207 | -0.103 | -0.069 |
| -2.397500000000034 | -0.204 | -0.102 | -0.068 |
| -2.395000000000034 | -0.202 | -0.101 | -0.067 |
| -2.392500000000034 | -0.2 | -0.1 | -0.067 |
| -2.390000000000034 | -0.197 | -0.099 | -0.066 |
| -2.387500000000034 | -0.195 | -0.098 | -0.065 |
| -2.385000000000034 | -0.193 | -0.096 | -0.064 |
| -2.382500000000034 | -0.191 | -0.095 | -0.064 |
| -2.380000000000034 | -0.188 | -0.094 | -0.063 |
| -2.377500000000035 | -0.186 | -0.093 | -0.062 |
| -2.375000000000035 | -0.184 | -0.092 | -0.061 |
| -2.372500000000035 | -0.182 | -0.091 | -0.061 |
| -2.370000000000035 | -0.18 | -0.09 | -0.06 |
| -2.367500000000035 | -0.178 | -0.089 | -0.059 |
| -2.365000000000035 | -0.176 | -0.088 | -0.059 |
| -2.362500000000035 | -0.173 | -0.087 | -0.058 |
| -2.360000000000035 | -0.171 | -0.086 | -0.057 |
| -2.357500000000035 | -0.169 | -0.085 | -0.056 |
| -2.355000000000035 | -0.167 | -0.084 | -0.056 |
| -2.352500000000035 | -0.165 | -0.083 | -0.055 |
| -2.350000000000035 | -0.163 | -0.082 | -0.054 |
| -2.347500000000035 | -0.161 | -0.081 | -0.054 |
| -2.345000000000035 | -0.159 | -0.08 | -0.053 |
| -2.342500000000035 | -0.157 | -0.079 | -0.052 |
| -2.340000000000035 | -0.155 | -0.078 | -0.052 |
| -2.337500000000035 | -0.153 | -0.077 | -0.051 |
| -2.335000000000035 | -0.151 | -0.076 | -0.05 |
| -2.332500000000035 | -0.149 | -0.075 | -0.05 |
| -2.330000000000036 | -0.147 | -0.074 | -0.049 |
| -2.327500000000036 | -0.146 | -0.073 | -0.049 |
| -2.325000000000036 | -0.144 | -0.072 | -0.048 |
| -2.322500000000036 | -0.142 | -0.071 | -0.047 |
| -2.320000000000036 | -0.14 | -0.07 | -0.047 |
| -2.317500000000036 | -0.138 | -0.069 | -0.046 |
| -2.315000000000036 | -0.136 | -0.068 | -0.045 |
| -2.312500000000036 | -0.134 | -0.067 | -0.045 |
| -2.310000000000036 | -0.133 | -0.066 | -0.044 |
| -2.307500000000036 | -0.131 | -0.065 | -0.044 |
| -2.305000000000036 | -0.129 | -0.064 | -0.043 |
| -2.302500000000036 | -0.127 | -0.064 | -0.042 |
| -2.300000000000036 | -0.125 | -0.063 | -0.042 |
| -2.297500000000036 | -0.124 | -0.062 | -0.041 |
| -2.295000000000036 | -0.122 | -0.061 | -0.041 |
| -2.292500000000036 | -0.12 | -0.06 | -0.04 |
| -2.290000000000036 | -0.118 | -0.059 | -0.039 |
| -2.287500000000036 | -0.117 | -0.058 | -0.039 |
| -2.285000000000036 | -0.115 | -0.057 | -0.038 |
| -2.282500000000036 | -0.113 | -0.057 | -0.038 |
| -2.280000000000036 | -0.111 | -0.056 | -0.037 |
| -2.277500000000036 | -0.11 | -0.055 | -0.037 |
| -2.275000000000037 | -0.108 | -0.054 | -0.036 |
| -2.272500000000037 | -0.106 | -0.053 | -0.035 |
| -2.270000000000037 | -0.105 | -0.052 | -0.035 |
| -2.267500000000036 | -0.103 | -0.051 | -0.034 |
| -2.265000000000037 | -0.101 | -0.051 | -0.034 |
| -2.262500000000037 | -0.1 | -0.05 | -0.033 |
| -2.260000000000037 | -0.098 | -0.049 | -0.033 |
| -2.257500000000037 | -0.096 | -0.048 | -0.032 |
| -2.255000000000037 | -0.095 | -0.047 | -0.032 |
| -2.252500000000037 | -0.093 | -0.047 | -0.031 |
| -2.250000000000037 | -0.091 | -0.046 | -0.03 |
| -2.247500000000037 | -0.09 | -0.045 | -0.03 |
| -2.245000000000037 | -0.088 | -0.044 | -0.029 |
| -2.242500000000037 | -0.087 | -0.043 | -0.029 |
| -2.240000000000037 | -0.085 | -0.043 | -0.028 |
| -2.237500000000037 | -0.083 | -0.042 | -0.028 |
| -2.235000000000038 | -0.082 | -0.041 | -0.027 |
| -2.232500000000038 | -0.08 | -0.04 | -0.027 |
| -2.230000000000038 | -0.079 | -0.039 | -0.026 |
| -2.227500000000037 | -0.077 | -0.039 | -0.026 |
| -2.225000000000038 | -0.076 | -0.038 | -0.025 |
| -2.222500000000038 | -0.074 | -0.037 | -0.025 |
| -2.220000000000038 | -0.073 | -0.036 | -0.024 |
| -2.217500000000038 | -0.071 | -0.035 | -0.024 |
| -2.215000000000038 | -0.069 | -0.035 | -0.023 |
| -2.212500000000038 | -0.068 | -0.034 | -0.023 |
| -2.210000000000038 | -0.066 | -0.033 | -0.022 |
| -2.207500000000038 | -0.065 | -0.032 | -0.022 |
| -2.205000000000038 | -0.063 | -0.032 | -0.021 |
| -2.202500000000038 | -0.062 | -0.031 | -0.021 |
| -2.200000000000038 | -0.06 | -0.03 | -0.02 |
| -2.197500000000038 | -0.059 | -0.029 | -0.02 |
| -2.195000000000038 | -0.057 | -0.029 | -0.019 |
| -2.192500000000038 | -0.056 | -0.028 | -0.019 |
| -2.190000000000039 | -0.054 | -0.027 | -0.018 |
| -2.187500000000038 | -0.053 | -0.026 | -0.018 |
| -2.185000000000039 | -0.052 | -0.026 | -0.017 |
| -2.182500000000039 | -0.05 | -0.025 | -0.017 |
| -2.180000000000039 | -0.049 | -0.024 | -0.016 |
| -2.177500000000039 | -0.047 | -0.024 | -0.016 |
| -2.175000000000039 | -0.046 | -0.023 | -0.015 |
| -2.172500000000039 | -0.044 | -0.022 | -0.015 |
| -2.170000000000039 | -0.043 | -0.021 | -0.014 |
| -2.16750000000004 | -0.041 | -0.021 | -0.014 |
| -2.16500000000004 | -0.04 | -0.02 | -0.013 |
| -2.16250000000004 | -0.039 | -0.019 | -0.013 |
| -2.16000000000004 | -0.037 | -0.019 | -0.012 |
| -2.15750000000004 | -0.036 | -0.018 | -0.012 |
| -2.155000000000039 | -0.034 | -0.017 | -0.011 |
| -2.152500000000039 | -0.033 | -0.016 | -0.011 |
| -2.150000000000039 | -0.031 | -0.016 | -0.01 |
| -2.14750000000004 | -0.03 | -0.015 | -0.01 |
| -2.14500000000004 | -0.029 | -0.014 | -0.01 |
| -2.14250000000004 | -0.027 | -0.014 | -0.009 |
| -2.14000000000004 | -0.026 | -0.013 | -0.009 |
| -2.13750000000004 | -0.024 | -0.012 | -0.008 |
| -2.13500000000004 | -0.023 | -0.012 | -0.008 |
| -2.13250000000004 | -0.022 | -0.011 | -0.007 |
| -2.13000000000004 | -0.02 | -0.01 | -0.007 |
| -2.12750000000004 | -0.019 | -0.009 | -0.006 |
| -2.12500000000004 | -0.018 | -0.009 | -0.006 |
| -2.12250000000004 | -0.016 | -0.008 | -0.005 |
| -2.12000000000004 | -0.015 | -0.007 | -0.005 |
| -2.11750000000004 | -0.013 | -0.007 | -0.004 |
| -2.11500000000004 | -0.012 | -0.006 | -0.004 |
| -2.11250000000004 | -0.011 | -0.005 | -0.004 |
| -2.11000000000004 | -0.009 | -0.005 | -0.003 |
| -2.10750000000004 | -0.008 | -0.004 | -0.003 |
| -2.10500000000004 | -0.007 | -0.003 | -0.002 |
| -2.10250000000004 | -0.005 | -0.003 | -0.002 |
| -2.10000000000004 | -0.004 | -0.002 | -0.001 |
| -2.097500000000041 | -0.003 | -0.001 | -0.001 |
| -2.095000000000041 | -0.001 | -0.001 | 0 |
| -2.092500000000041 | 0 | 0 | 0 |
| -2.090000000000041 | 0.001 | 0.001 | 0 |
| -2.087500000000041 | 0.003 | 0.001 | 0.001 |
| -2.085000000000041 | 0.004 | 0.002 | 0.001 |
| -2.082500000000041 | 0.005 | 0.003 | 0.002 |
| -2.080000000000041 | 0.007 | 0.003 | 0.002 |
| -2.077500000000041 | 0.008 | 0.004 | 0.003 |
| -2.075000000000041 | 0.009 | 0.005 | 0.003 |
| -2.072500000000041 | 0.011 | 0.005 | 0.004 |
| -2.070000000000041 | 0.012 | 0.006 | 0.004 |
| -2.067500000000041 | 0.013 | 0.007 | 0.004 |
| -2.065000000000041 | 0.014 | 0.007 | 0.005 |
| -2.062500000000041 | 0.016 | 0.008 | 0.005 |
| -2.060000000000041 | 0.017 | 0.009 | 0.006 |
| -2.057500000000041 | 0.018 | 0.009 | 0.006 |
| -2.055000000000041 | 0.02 | 0.01 | 0.007 |
| -2.052500000000042 | 0.021 | 0.01 | 0.007 |
| -2.050000000000042 | 0.022 | 0.011 | 0.007 |
| -2.047500000000042 | 0.023 | 0.012 | 0.008 |
| -2.045000000000042 | 0.025 | 0.012 | 0.008 |
| -2.042500000000042 | 0.026 | 0.013 | 0.009 |
| -2.040000000000042 | 0.027 | 0.014 | 0.009 |
| -2.037500000000042 | 0.029 | 0.014 | 0.01 |
| -2.035000000000042 | 0.03 | 0.015 | 0.01 |
| -2.032500000000042 | 0.031 | 0.016 | 0.01 |
| -2.030000000000042 | 0.032 | 0.016 | 0.011 |
| -2.027500000000042 | 0.034 | 0.017 | 0.011 |
| -2.025000000000042 | 0.035 | 0.017 | 0.012 |
| -2.022500000000042 | 0.036 | 0.018 | 0.012 |
| -2.020000000000042 | 0.037 | 0.019 | 0.012 |
| -2.017500000000042 | 0.039 | 0.019 | 0.013 |
| -2.015000000000042 | 0.04 | 0.02 | 0.013 |
| -2.012500000000042 | 0.041 | 0.021 | 0.014 |
| -2.010000000000042 | 0.043 | 0.021 | 0.014 |
| -2.007500000000042 | 0.044 | 0.022 | 0.015 |
| -2.005000000000043 | 0.045 | 0.023 | 0.015 |
| -2.002500000000043 | 0.046 | 0.023 | 0.015 |
| -2.000000000000043 | 0.048 | 0.024 | 0.016 |
| -1.997500000000043 | 0.049 | 0.024 | 0.016 |
| -1.995000000000043 | 0.05 | 0.025 | 0.017 |
| -1.992500000000043 | 0.051 | 0.026 | 0.017 |
| -1.990000000000043 | 0.053 | 0.026 | 0.018 |
| -1.987500000000043 | 0.054 | 0.027 | 0.018 |
| -1.985000000000043 | 0.055 | 0.028 | 0.018 |
| -1.982500000000043 | 0.056 | 0.028 | 0.019 |
| -1.980000000000043 | 0.057 | 0.029 | 0.019 |
| -1.977500000000043 | 0.059 | 0.029 | 0.02 |
| -1.975000000000043 | 0.06 | 0.03 | 0.02 |
| -1.972500000000043 | 0.061 | 0.031 | 0.02 |
| -1.970000000000043 | 0.062 | 0.031 | 0.021 |
| -1.967500000000043 | 0.064 | 0.032 | 0.021 |
| -1.965000000000043 | 0.065 | 0.032 | 0.022 |
| -1.962500000000043 | 0.066 | 0.033 | 0.022 |
| -1.960000000000043 | 0.067 | 0.034 | 0.022 |
| -1.957500000000044 | 0.069 | 0.034 | 0.023 |
| -1.955000000000044 | 0.07 | 0.035 | 0.023 |
| -1.952500000000044 | 0.071 | 0.036 | 0.024 |
| -1.950000000000044 | 0.072 | 0.036 | 0.024 |
| -1.947500000000044 | 0.073 | 0.037 | 0.024 |
| -1.945000000000044 | 0.075 | 0.037 | 0.025 |
| -1.942500000000044 | 0.076 | 0.038 | 0.025 |
| -1.940000000000044 | 0.077 | 0.039 | 0.026 |
| -1.937500000000044 | 0.078 | 0.039 | 0.026 |
| -1.935000000000044 | 0.08 | 0.04 | 0.027 |
| -1.932500000000044 | 0.081 | 0.04 | 0.027 |
| -1.930000000000044 | 0.082 | 0.041 | 0.027 |
| -1.927500000000044 | 0.083 | 0.042 | 0.028 |
| -1.925000000000044 | 0.084 | 0.042 | 0.028 |
| -1.922500000000044 | 0.086 | 0.043 | 0.029 |
| -1.920000000000044 | 0.087 | 0.043 | 0.029 |
| -1.917500000000044 | 0.088 | 0.044 | 0.029 |
| -1.915000000000044 | 0.089 | 0.045 | 0.03 |
| -1.912500000000044 | 0.091 | 0.045 | 0.03 |
| -1.910000000000045 | 0.092 | 0.046 | 0.031 |
| -1.907500000000045 | 0.093 | 0.046 | 0.031 |
| -1.905000000000045 | 0.094 | 0.047 | 0.031 |
| -1.902500000000045 | 0.095 | 0.048 | 0.032 |
| -1.900000000000045 | 0.097 | 0.048 | 0.032 |
| -1.897500000000045 | 0.098 | 0.049 | 0.033 |
| -1.895000000000045 | 0.099 | 0.049 | 0.033 |
| -1.892500000000045 | 0.1 | 0.05 | 0.033 |
| -1.890000000000045 | 0.101 | 0.051 | 0.034 |
| -1.887500000000045 | 0.103 | 0.051 | 0.034 |
| -1.885000000000045 | 0.104 | 0.052 | 0.035 |
| -1.882500000000045 | 0.105 | 0.052 | 0.035 |
| -1.880000000000045 | 0.106 | 0.053 | 0.035 |
| -1.877500000000045 | 0.107 | 0.054 | 0.036 |
| -1.875000000000045 | 0.109 | 0.054 | 0.036 |
| -1.872500000000045 | 0.11 | 0.055 | 0.037 |
| -1.870000000000045 | 0.111 | 0.055 | 0.037 |
| -1.867500000000045 | 0.112 | 0.056 | 0.037 |
| -1.865000000000045 | 0.113 | 0.057 | 0.038 |
| -1.862500000000046 | 0.115 | 0.057 | 0.038 |
| -1.860000000000046 | 0.116 | 0.058 | 0.039 |
| -1.857500000000046 | 0.117 | 0.058 | 0.039 |
| -1.855000000000046 | 0.118 | 0.059 | 0.039 |
| -1.852500000000046 | 0.119 | 0.06 | 0.04 |
| -1.850000000000046 | 0.121 | 0.06 | 0.04 |
| -1.847500000000046 | 0.122 | 0.061 | 0.041 |
| -1.845000000000046 | 0.123 | 0.061 | 0.041 |
| -1.842500000000046 | 0.124 | 0.062 | 0.041 |
| -1.840000000000046 | 0.125 | 0.063 | 0.042 |
| -1.837500000000046 | 0.127 | 0.063 | 0.042 |
| -1.835000000000046 | 0.128 | 0.064 | 0.043 |
| -1.832500000000046 | 0.129 | 0.064 | 0.043 |
| -1.830000000000046 | 0.13 | 0.065 | 0.043 |
| -1.827500000000046 | 0.131 | 0.066 | 0.044 |
| -1.825000000000046 | 0.133 | 0.066 | 0.044 |
| -1.822500000000046 | 0.134 | 0.067 | 0.045 |
| -1.820000000000046 | 0.135 | 0.067 | 0.045 |
| -1.817500000000046 | 0.136 | 0.068 | 0.045 |
| -1.815000000000047 | 0.137 | 0.069 | 0.046 |
| -1.812500000000047 | 0.139 | 0.069 | 0.046 |
| -1.810000000000047 | 0.14 | 0.07 | 0.047 |
| -1.807500000000047 | 0.141 | 0.07 | 0.047 |
| -1.805000000000047 | 0.142 | 0.071 | 0.047 |
| -1.802500000000047 | 0.143 | 0.072 | 0.048 |
| -1.800000000000047 | 0.145 | 0.072 | 0.048 |
| -1.797500000000047 | 0.146 | 0.073 | 0.049 |
| -1.795000000000047 | 0.147 | 0.073 | 0.049 |
| -1.792500000000047 | 0.148 | 0.074 | 0.049 |
| -1.790000000000047 | 0.149 | 0.075 | 0.05 |
| -1.787500000000047 | 0.151 | 0.075 | 0.05 |
| -1.785000000000047 | 0.152 | 0.076 | 0.051 |
| -1.782500000000047 | 0.153 | 0.076 | 0.051 |
| -1.780000000000047 | 0.154 | 0.077 | 0.051 |
| -1.777500000000047 | 0.155 | 0.078 | 0.052 |
| -1.775000000000047 | 0.157 | 0.078 | 0.052 |
| -1.772500000000047 | 0.158 | 0.079 | 0.053 |
| -1.770000000000047 | 0.159 | 0.079 | 0.053 |
| -1.767500000000048 | 0.16 | 0.08 | 0.053 |
| -1.765000000000048 | 0.161 | 0.081 | 0.054 |
| -1.762500000000048 | 0.163 | 0.081 | 0.054 |
| -1.760000000000048 | 0.164 | 0.082 | 0.055 |
| -1.757500000000048 | 0.165 | 0.082 | 0.055 |
| -1.755000000000048 | 0.166 | 0.083 | 0.055 |
| -1.752500000000048 | 0.167 | 0.084 | 0.056 |
| -1.750000000000048 | 0.169 | 0.084 | 0.056 |
| -1.747500000000048 | 0.17 | 0.085 | 0.057 |
| -1.745000000000048 | 0.171 | 0.085 | 0.057 |
| -1.742500000000048 | 0.172 | 0.086 | 0.057 |
| -1.740000000000048 | 0.173 | 0.087 | 0.058 |
| -1.737500000000048 | 0.175 | 0.087 | 0.058 |
| -1.735000000000048 | 0.176 | 0.088 | 0.059 |
| -1.732500000000048 | 0.177 | 0.088 | 0.059 |
| -1.730000000000048 | 0.178 | 0.089 | 0.059 |
| -1.727500000000048 | 0.179 | 0.09 | 0.06 |
| -1.725000000000048 | 0.181 | 0.09 | 0.06 |
| -1.722500000000048 | 0.182 | 0.091 | 0.061 |
| -1.720000000000049 | 0.183 | 0.092 | 0.061 |
| -1.717500000000049 | 0.184 | 0.092 | 0.061 |
| -1.715000000000049 | 0.185 | 0.093 | 0.062 |
| -1.712500000000049 | 0.187 | 0.093 | 0.062 |
| -1.710000000000049 | 0.188 | 0.094 | 0.063 |
| -1.707500000000049 | 0.189 | 0.095 | 0.063 |
| -1.705000000000049 | 0.19 | 0.095 | 0.063 |
| -1.702500000000049 | 0.191 | 0.096 | 0.064 |
| -1.700000000000049 | 0.193 | 0.096 | 0.064 |
| -1.697500000000049 | 0.194 | 0.097 | 0.065 |
| -1.69500000000005 | 0.195 | 0.098 | 0.065 |
| -1.69250000000005 | 0.196 | 0.098 | 0.065 |
| -1.69000000000005 | 0.198 | 0.099 | 0.066 |
| -1.687500000000049 | 0.199 | 0.099 | 0.066 |
| -1.685000000000049 | 0.2 | 0.1 | 0.067 |
| -1.682500000000049 | 0.201 | 0.101 | 0.067 |
| -1.680000000000049 | 0.202 | 0.101 | 0.067 |
| -1.677500000000049 | 0.204 | 0.102 | 0.068 |
| -1.675000000000049 | 0.205 | 0.102 | 0.068 |
| -1.67250000000005 | 0.206 | 0.103 | 0.069 |
| -1.67000000000005 | 0.207 | 0.104 | 0.069 |
| -1.66750000000005 | 0.209 | 0.104 | 0.07 |
| -1.66500000000005 | 0.21 | 0.105 | 0.07 |
| -1.66250000000005 | 0.211 | 0.106 | 0.07 |
| -1.66000000000005 | 0.212 | 0.106 | 0.071 |
| -1.65750000000005 | 0.213 | 0.107 | 0.071 |
| -1.65500000000005 | 0.215 | 0.107 | 0.072 |
| -1.65250000000005 | 0.216 | 0.108 | 0.072 |
| -1.65000000000005 | 0.217 | 0.109 | 0.072 |
| -1.64750000000005 | 0.218 | 0.109 | 0.073 |
| -1.64500000000005 | 0.22 | 0.11 | 0.073 |
| -1.64250000000005 | 0.221 | 0.11 | 0.074 |
| -1.64000000000005 | 0.222 | 0.111 | 0.074 |
| -1.63750000000005 | 0.223 | 0.112 | 0.074 |
| -1.63500000000005 | 0.225 | 0.112 | 0.075 |
| -1.63250000000005 | 0.226 | 0.113 | 0.075 |
| -1.63000000000005 | 0.227 | 0.114 | 0.076 |
| -1.62750000000005 | 0.228 | 0.114 | 0.076 |
| -1.625000000000051 | 0.23 | 0.115 | 0.077 |
| -1.622500000000051 | 0.231 | 0.115 | 0.077 |
| -1.620000000000051 | 0.232 | 0.116 | 0.077 |
| -1.617500000000051 | 0.233 | 0.117 | 0.078 |
| -1.615000000000051 | 0.235 | 0.117 | 0.078 |
| -1.612500000000051 | 0.236 | 0.118 | 0.079 |
| -1.610000000000051 | 0.237 | 0.119 | 0.079 |
| -1.607500000000051 | 0.238 | 0.119 | 0.079 |
| -1.605000000000051 | 0.24 | 0.12 | 0.08 |
| -1.602500000000051 | 0.241 | 0.12 | 0.08 |
| -1.600000000000051 | 0.242 | 0.121 | 0.081 |
| -1.597500000000051 | 0.243 | 0.122 | 0.081 |
| -1.595000000000051 | 0.245 | 0.122 | 0.082 |
| -1.592500000000051 | 0.246 | 0.123 | 0.082 |
| -1.590000000000051 | 0.247 | 0.124 | 0.082 |
| -1.587500000000051 | 0.248 | 0.124 | 0.083 |
| -1.585000000000051 | 0.25 | 0.125 | 0.083 |
| -1.582500000000052 | 0.251 | 0.125 | 0.084 |
| -1.580000000000052 | 0.252 | 0.126 | 0.084 |
| -1.577500000000052 | 0.254 | 0.127 | 0.085 |
| -1.575000000000052 | 0.255 | 0.127 | 0.085 |
| -1.572500000000052 | 0.256 | 0.128 | 0.085 |
| -1.570000000000052 | 0.257 | 0.129 | 0.086 |
| -1.567500000000052 | 0.259 | 0.129 | 0.086 |
| -1.565000000000052 | 0.26 | 0.13 | 0.087 |
| -1.562500000000052 | 0.261 | 0.131 | 0.087 |
| -1.560000000000052 | 0.262 | 0.131 | 0.087 |
| -1.557500000000052 | 0.264 | 0.132 | 0.088 |
| -1.555000000000052 | 0.265 | 0.133 | 0.088 |
| -1.552500000000052 | 0.266 | 0.133 | 0.089 |
| -1.550000000000052 | 0.268 | 0.134 | 0.089 |
| -1.547500000000052 | 0.269 | 0.134 | 0.09 |
| -1.545000000000052 | 0.27 | 0.135 | 0.09 |
| -1.542500000000052 | 0.272 | 0.136 | 0.091 |
| -1.540000000000052 | 0.273 | 0.136 | 0.091 |
| -1.537500000000052 | 0.274 | 0.137 | 0.091 |
| -1.535000000000053 | 0.275 | 0.138 | 0.092 |
| -1.532500000000053 | 0.277 | 0.138 | 0.092 |
| -1.530000000000053 | 0.278 | 0.139 | 0.093 |
| -1.527500000000053 | 0.279 | 0.14 | 0.093 |
| -1.525000000000053 | 0.281 | 0.14 | 0.094 |
| -1.522500000000053 | 0.282 | 0.141 | 0.094 |
| -1.520000000000053 | 0.283 | 0.142 | 0.094 |
| -1.517500000000053 | 0.285 | 0.142 | 0.095 |
| -1.515000000000053 | 0.286 | 0.143 | 0.095 |
| -1.512500000000053 | 0.287 | 0.144 | 0.096 |
| -1.510000000000053 | 0.289 | 0.144 | 0.096 |
| -1.507500000000053 | 0.29 | 0.145 | 0.097 |
| -1.505000000000053 | 0.291 | 0.146 | 0.097 |
| -1.502500000000053 | 0.293 | 0.146 | 0.098 |
| -1.500000000000053 | 0.294 | 0.147 | 0.098 |
| -1.497500000000053 | 0.295 | 0.148 | 0.098 |
| -1.495000000000053 | 0.297 | 0.148 | 0.099 |
| -1.492500000000053 | 0.298 | 0.149 | 0.099 |
| -1.490000000000053 | 0.299 | 0.15 | 0.1 |
| -1.487500000000054 | 0.301 | 0.15 | 0.1 |
| -1.485000000000054 | 0.302 | 0.151 | 0.101 |
| -1.482500000000054 | 0.303 | 0.152 | 0.101 |
| -1.480000000000054 | 0.305 | 0.152 | 0.102 |
| -1.477500000000054 | 0.306 | 0.153 | 0.102 |
| -1.475000000000054 | 0.307 | 0.154 | 0.102 |
| -1.472500000000054 | 0.309 | 0.154 | 0.103 |
| -1.470000000000054 | 0.31 | 0.155 | 0.103 |
| -1.467500000000054 | 0.311 | 0.156 | 0.104 |
| -1.465000000000054 | 0.313 | 0.156 | 0.104 |
| -1.462500000000054 | 0.314 | 0.157 | 0.105 |
| -1.460000000000054 | 0.316 | 0.158 | 0.105 |
| -1.457500000000054 | 0.317 | 0.158 | 0.106 |
| -1.455000000000054 | 0.318 | 0.159 | 0.106 |
| -1.452500000000054 | 0.32 | 0.16 | 0.107 |
| -1.450000000000054 | 0.321 | 0.161 | 0.107 |
| -1.447500000000054 | 0.322 | 0.161 | 0.107 |
| -1.445000000000054 | 0.324 | 0.162 | 0.108 |
| -1.442500000000054 | 0.325 | 0.163 | 0.108 |
| -1.440000000000055 | 0.327 | 0.163 | 0.109 |
| -1.437500000000055 | 0.328 | 0.164 | 0.109 |
| -1.435000000000055 | 0.329 | 0.165 | 0.11 |
| -1.432500000000055 | 0.331 | 0.165 | 0.11 |
| -1.430000000000055 | 0.332 | 0.166 | 0.111 |
| -1.427500000000055 | 0.334 | 0.167 | 0.111 |
| -1.425000000000055 | 0.335 | 0.167 | 0.112 |
| -1.422500000000055 | 0.336 | 0.168 | 0.112 |
| -1.420000000000055 | 0.338 | 0.169 | 0.113 |
| -1.417500000000055 | 0.339 | 0.17 | 0.113 |
| -1.415000000000055 | 0.341 | 0.17 | 0.114 |
| -1.412500000000055 | 0.342 | 0.171 | 0.114 |
| -1.410000000000055 | 0.344 | 0.172 | 0.115 |
| -1.407500000000055 | 0.345 | 0.172 | 0.115 |
| -1.405000000000055 | 0.346 | 0.173 | 0.115 |
| -1.402500000000055 | 0.348 | 0.174 | 0.116 |
| -1.400000000000055 | 0.349 | 0.175 | 0.116 |
| -1.397500000000055 | 0.351 | 0.175 | 0.117 |
| -1.395000000000055 | 0.352 | 0.176 | 0.117 |
| -1.392500000000056 | 0.354 | 0.177 | 0.118 |
| -1.390000000000056 | 0.355 | 0.178 | 0.118 |
| -1.387500000000056 | 0.356 | 0.178 | 0.119 |
| -1.385000000000056 | 0.358 | 0.179 | 0.119 |
| -1.382500000000056 | 0.359 | 0.18 | 0.12 |
| -1.380000000000056 | 0.361 | 0.18 | 0.12 |
| -1.377500000000056 | 0.362 | 0.181 | 0.121 |
| -1.375000000000056 | 0.364 | 0.182 | 0.121 |
| -1.372500000000056 | 0.365 | 0.183 | 0.122 |
| -1.370000000000056 | 0.367 | 0.183 | 0.122 |
| -1.367500000000056 | 0.368 | 0.184 | 0.123 |
| -1.365000000000056 | 0.37 | 0.185 | 0.123 |
| -1.362500000000056 | 0.371 | 0.186 | 0.124 |
| -1.360000000000056 | 0.373 | 0.186 | 0.124 |
| -1.357500000000056 | 0.374 | 0.187 | 0.125 |
| -1.355000000000056 | 0.376 | 0.188 | 0.125 |
| -1.352500000000056 | 0.377 | 0.189 | 0.126 |
| -1.350000000000056 | 0.379 | 0.189 | 0.126 |
| -1.347500000000056 | 0.38 | 0.19 | 0.127 |
| -1.345000000000057 | 0.382 | 0.191 | 0.127 |
| -1.342500000000057 | 0.383 | 0.192 | 0.128 |
| -1.340000000000057 | 0.385 | 0.192 | 0.128 |
| -1.337500000000057 | 0.386 | 0.193 | 0.129 |
| -1.335000000000057 | 0.388 | 0.194 | 0.129 |
| -1.332500000000057 | 0.389 | 0.195 | 0.13 |
| -1.330000000000057 | 0.391 | 0.195 | 0.13 |
| -1.327500000000057 | 0.392 | 0.196 | 0.131 |
| -1.325000000000057 | 0.394 | 0.197 | 0.131 |
| -1.322500000000057 | 0.396 | 0.198 | 0.132 |
| -1.320000000000057 | 0.397 | 0.199 | 0.132 |
| -1.317500000000057 | 0.399 | 0.199 | 0.133 |
| -1.315000000000057 | 0.4 | 0.2 | 0.133 |
| -1.312500000000057 | 0.402 | 0.201 | 0.134 |
| -1.310000000000057 | 0.403 | 0.202 | 0.134 |
| -1.307500000000057 | 0.405 | 0.202 | 0.135 |
| -1.305000000000057 | 0.406 | 0.203 | 0.135 |
| -1.302500000000057 | 0.408 | 0.204 | 0.136 |
| -1.300000000000058 | 0.41 | 0.205 | 0.137 |
| -1.297500000000058 | 0.411 | 0.206 | 0.137 |
| -1.295000000000058 | 0.413 | 0.206 | 0.138 |
| -1.292500000000058 | 0.414 | 0.207 | 0.138 |
| -1.290000000000058 | 0.416 | 0.208 | 0.139 |
| -1.287500000000058 | 0.418 | 0.209 | 0.139 |
| -1.285000000000058 | 0.419 | 0.21 | 0.14 |
| -1.282500000000058 | 0.421 | 0.21 | 0.14 |
| -1.280000000000058 | 0.423 | 0.211 | 0.141 |
| -1.277500000000058 | 0.424 | 0.212 | 0.141 |
| -1.275000000000058 | 0.426 | 0.213 | 0.142 |
| -1.272500000000058 | 0.427 | 0.214 | 0.142 |
| -1.270000000000058 | 0.429 | 0.215 | 0.143 |
| -1.267500000000058 | 0.431 | 0.215 | 0.144 |
| -1.265000000000058 | 0.432 | 0.216 | 0.144 |
| -1.262500000000058 | 0.434 | 0.217 | 0.145 |
| -1.260000000000058 | 0.436 | 0.218 | 0.145 |
| -1.257500000000058 | 0.437 | 0.219 | 0.146 |
| -1.255000000000058 | 0.439 | 0.22 | 0.146 |
| -1.252500000000059 | 0.441 | 0.22 | 0.147 |
| -1.250000000000059 | 0.442 | 0.221 | 0.147 |
| -1.247500000000059 | 0.444 | 0.222 | 0.148 |
| -1.245000000000059 | 0.446 | 0.223 | 0.149 |
| -1.242500000000059 | 0.447 | 0.224 | 0.149 |
| -1.240000000000059 | 0.449 | 0.225 | 0.15 |
| -1.237500000000059 | 0.451 | 0.225 | 0.15 |
| -1.235000000000059 | 0.453 | 0.226 | 0.151 |
| -1.232500000000059 | 0.454 | 0.227 | 0.151 |
| -1.23000000000006 | 0.456 | 0.228 | 0.152 |
| -1.227500000000059 | 0.458 | 0.229 | 0.153 |
| -1.225000000000059 | 0.459 | 0.23 | 0.153 |
| -1.222500000000059 | 0.461 | 0.231 | 0.154 |
| -1.220000000000059 | 0.463 | 0.231 | 0.154 |
| -1.217500000000059 | 0.465 | 0.232 | 0.155 |
| -1.215000000000059 | 0.466 | 0.233 | 0.155 |
| -1.212500000000059 | 0.468 | 0.234 | 0.156 |
| -1.210000000000059 | 0.47 | 0.235 | 0.157 |
| -1.20750000000006 | 0.472 | 0.236 | 0.157 |
| -1.20500000000006 | 0.474 | 0.237 | 0.158 |
| -1.20250000000006 | 0.475 | 0.238 | 0.158 |
| -1.20000000000006 | 0.477 | 0.239 | 0.159 |
| -1.19750000000006 | 0.479 | 0.239 | 0.16 |
| -1.19500000000006 | 0.481 | 0.24 | 0.16 |
| -1.19250000000006 | 0.483 | 0.241 | 0.161 |
| -1.19000000000006 | 0.484 | 0.242 | 0.161 |
| -1.18750000000006 | 0.486 | 0.243 | 0.162 |
| -1.18500000000006 | 0.488 | 0.244 | 0.163 |
| -1.18250000000006 | 0.49 | 0.245 | 0.163 |
| -1.18000000000006 | 0.492 | 0.246 | 0.164 |
| -1.17750000000006 | 0.494 | 0.247 | 0.165 |
| -1.17500000000006 | 0.495 | 0.248 | 0.165 |
| -1.17250000000006 | 0.497 | 0.249 | 0.166 |
| -1.17000000000006 | 0.499 | 0.25 | 0.166 |
| -1.16750000000006 | 0.501 | 0.251 | 0.167 |
| -1.16500000000006 | 0.503 | 0.251 | 0.168 |
| -1.16250000000006 | 0.505 | 0.252 | 0.168 |
| -1.160000000000061 | 0.507 | 0.253 | 0.169 |
| -1.157500000000061 | 0.509 | 0.254 | 0.17 |
| -1.155000000000061 | 0.511 | 0.255 | 0.17 |
| -1.152500000000061 | 0.512 | 0.256 | 0.171 |
| -1.150000000000061 | 0.514 | 0.257 | 0.171 |
| -1.147500000000061 | 0.516 | 0.258 | 0.172 |
| -1.145000000000061 | 0.518 | 0.259 | 0.173 |
| -1.142500000000061 | 0.52 | 0.26 | 0.173 |
| -1.140000000000061 | 0.522 | 0.261 | 0.174 |
| -1.137500000000061 | 0.524 | 0.262 | 0.175 |
| -1.135000000000061 | 0.526 | 0.263 | 0.175 |
| -1.132500000000061 | 0.528 | 0.264 | 0.176 |
| -1.130000000000061 | 0.53 | 0.265 | 0.177 |
| -1.127500000000061 | 0.532 | 0.266 | 0.177 |
| -1.125000000000061 | 0.534 | 0.267 | 0.178 |
| -1.122500000000061 | 0.536 | 0.268 | 0.179 |
| -1.120000000000061 | 0.538 | 0.269 | 0.179 |
| -1.117500000000061 | 0.54 | 0.27 | 0.18 |
| -1.115000000000061 | 0.542 | 0.271 | 0.181 |
| -1.112500000000062 | 0.544 | 0.272 | 0.181 |
| -1.110000000000062 | 0.546 | 0.273 | 0.182 |
| -1.107500000000062 | 0.548 | 0.274 | 0.183 |
| -1.105000000000062 | 0.55 | 0.275 | 0.183 |
| -1.102500000000062 | 0.552 | 0.276 | 0.184 |
| -1.100000000000062 | 0.554 | 0.277 | 0.185 |
| -1.097500000000062 | 0.557 | 0.278 | 0.186 |
| -1.095000000000062 | 0.559 | 0.279 | 0.186 |
| -1.092500000000062 | 0.561 | 0.28 | 0.187 |
| -1.090000000000062 | 0.563 | 0.281 | 0.188 |
| -1.087500000000062 | 0.565 | 0.282 | 0.188 |
| -1.085000000000062 | 0.567 | 0.284 | 0.189 |
| -1.082500000000062 | 0.569 | 0.285 | 0.19 |
| -1.080000000000062 | 0.571 | 0.286 | 0.19 |
| -1.077500000000062 | 0.574 | 0.287 | 0.191 |
| -1.075000000000062 | 0.576 | 0.288 | 0.192 |
| -1.072500000000062 | 0.578 | 0.289 | 0.193 |
| -1.070000000000062 | 0.58 | 0.29 | 0.193 |
| -1.067500000000062 | 0.582 | 0.291 | 0.194 |
| -1.065000000000063 | 0.585 | 0.292 | 0.195 |
| -1.062500000000063 | 0.587 | 0.293 | 0.196 |
| -1.060000000000063 | 0.589 | 0.294 | 0.196 |
| -1.057500000000063 | 0.591 | 0.296 | 0.197 |
| -1.055000000000063 | 0.593 | 0.297 | 0.198 |
| -1.052500000000063 | 0.596 | 0.298 | 0.199 |
| -1.050000000000063 | 0.598 | 0.299 | 0.199 |
| -1.047500000000063 | 0.6 | 0.3 | 0.2 |
| -1.045000000000063 | 0.603 | 0.301 | 0.201 |
| -1.042500000000063 | 0.605 | 0.302 | 0.202 |
| -1.040000000000063 | 0.607 | 0.304 | 0.202 |
| -1.037500000000063 | 0.609 | 0.305 | 0.203 |
| -1.035000000000063 | 0.612 | 0.306 | 0.204 |
| -1.032500000000063 | 0.614 | 0.307 | 0.205 |
| -1.030000000000063 | 0.616 | 0.308 | 0.205 |
| -1.027500000000063 | 0.619 | 0.309 | 0.206 |
| -1.025000000000063 | 0.621 | 0.311 | 0.207 |
| -1.022500000000063 | 0.624 | 0.312 | 0.208 |
| -1.020000000000064 | 0.626 | 0.313 | 0.209 |
| -1.017500000000064 | 0.628 | 0.314 | 0.209 |
| -1.015000000000064 | 0.631 | 0.315 | 0.21 |
| -1.012500000000064 | 0.633 | 0.317 | 0.211 |
| -1.010000000000064 | 0.636 | 0.318 | 0.212 |
| -1.007500000000064 | 0.638 | 0.319 | 0.213 |
| -1.005000000000064 | 0.641 | 0.32 | 0.214 |
| -1.002500000000064 | 0.643 | 0.322 | 0.214 |
| -1.000000000000064 | 0.646 | 0.323 | 0.215 |
| -0.997500000000064 | 0.648 | 0.324 | 0.216 |
| -0.995000000000064 | 0.651 | 0.325 | 0.217 |
| -0.992500000000064 | 0.653 | 0.327 | 0.218 |
| -0.990000000000064 | 0.656 | 0.328 | 0.219 |
| -0.987500000000064 | 0.658 | 0.329 | 0.219 |
| -0.985000000000064 | 0.661 | 0.33 | 0.22 |
| -0.982500000000064 | 0.663 | 0.332 | 0.221 |
| -0.980000000000064 | 0.666 | 0.333 | 0.222 |
| -0.977500000000064 | 0.669 | 0.334 | 0.223 |
| -0.975000000000064 | 0.671 | 0.336 | 0.224 |
| -0.972500000000065 | 0.674 | 0.337 | 0.225 |
| -0.970000000000065 | 0.677 | 0.338 | 0.226 |
| -0.967500000000065 | 0.679 | 0.34 | 0.226 |
| -0.965000000000065 | 0.682 | 0.341 | 0.227 |
| -0.962500000000065 | 0.685 | 0.342 | 0.228 |
| -0.960000000000065 | 0.687 | 0.344 | 0.229 |
| -0.957500000000065 | 0.69 | 0.345 | 0.23 |
| -0.955000000000065 | 0.693 | 0.346 | 0.231 |
| -0.952500000000065 | 0.696 | 0.348 | 0.232 |
| -0.950000000000065 | 0.698 | 0.349 | 0.233 |
| -0.947500000000065 | 0.701 | 0.351 | 0.234 |
| -0.945000000000065 | 0.704 | 0.352 | 0.235 |
| -0.942500000000065 | 0.707 | 0.353 | 0.236 |
| -0.940000000000065 | 0.71 | 0.355 | 0.237 |
| -0.937500000000065 | 0.712 | 0.356 | 0.237 |
| -0.935000000000065 | 0.715 | 0.358 | 0.238 |
| -0.932500000000065 | 0.718 | 0.359 | 0.239 |
| -0.930000000000065 | 0.721 | 0.361 | 0.24 |
| -0.927500000000065 | 0.724 | 0.362 | 0.241 |
| -0.925000000000066 | 0.727 | 0.363 | 0.242 |
| -0.922500000000066 | 0.73 | 0.365 | 0.243 |
| -0.920000000000066 | 0.733 | 0.366 | 0.244 |
| -0.917500000000066 | 0.736 | 0.368 | 0.245 |
| -0.915000000000066 | 0.739 | 0.369 | 0.246 |
| -0.912500000000066 | 0.742 | 0.371 | 0.247 |
| -0.910000000000066 | 0.745 | 0.372 | 0.248 |
| -0.907500000000066 | 0.748 | 0.374 | 0.249 |
| -0.905000000000066 | 0.751 | 0.375 | 0.25 |
| -0.902500000000066 | 0.754 | 0.377 | 0.251 |
| -0.900000000000066 | 0.757 | 0.379 | 0.252 |
| -0.897500000000066 | 0.76 | 0.38 | 0.253 |
| -0.895000000000066 | 0.763 | 0.382 | 0.254 |
| -0.892500000000066 | 0.767 | 0.383 | 0.256 |
| -0.890000000000066 | 0.77 | 0.385 | 0.257 |
| -0.887500000000066 | 0.773 | 0.386 | 0.258 |
| -0.885000000000066 | 0.776 | 0.388 | 0.259 |
| -0.882500000000066 | 0.779 | 0.39 | 0.26 |
| -0.880000000000066 | 0.783 | 0.391 | 0.261 |
| -0.877500000000067 | 0.786 | 0.393 | 0.262 |
| -0.875000000000067 | 0.789 | 0.395 | 0.263 |
| -0.872500000000067 | 0.793 | 0.396 | 0.264 |
| -0.870000000000067 | 0.796 | 0.398 | 0.265 |
| -0.867500000000067 | 0.799 | 0.4 | 0.266 |
| -0.865000000000067 | 0.803 | 0.401 | 0.268 |
| -0.862500000000067 | 0.806 | 0.403 | 0.269 |
| -0.860000000000067 | 0.81 | 0.405 | 0.27 |
| -0.857500000000067 | 0.813 | 0.407 | 0.271 |
| -0.855000000000067 | 0.817 | 0.408 | 0.272 |
| -0.852500000000067 | 0.82 | 0.41 | 0.273 |
| -0.850000000000067 | 0.824 | 0.412 | 0.275 |
| -0.847500000000067 | 0.827 | 0.414 | 0.276 |
| -0.845000000000067 | 0.831 | 0.415 | 0.277 |
| -0.842500000000067 | 0.835 | 0.417 | 0.278 |
| -0.840000000000067 | 0.838 | 0.419 | 0.279 |
| -0.837500000000067 | 0.842 | 0.421 | 0.281 |
| -0.835000000000067 | 0.846 | 0.423 | 0.282 |
| -0.832500000000067 | 0.849 | 0.425 | 0.283 |
| -0.830000000000068 | 0.853 | 0.426 | 0.284 |
| -0.827500000000068 | 0.857 | 0.428 | 0.286 |
| -0.825000000000068 | 0.861 | 0.43 | 0.287 |
| -0.822500000000068 | 0.864 | 0.432 | 0.288 |
| -0.820000000000068 | 0.868 | 0.434 | 0.289 |
| -0.817500000000068 | 0.872 | 0.436 | 0.291 |
| -0.815000000000068 | 0.876 | 0.438 | 0.292 |
| -0.812500000000068 | 0.88 | 0.44 | 0.293 |
| -0.810000000000068 | 0.884 | 0.442 | 0.295 |
| -0.807500000000068 | 0.888 | 0.444 | 0.296 |
| -0.805000000000068 | 0.892 | 0.446 | 0.297 |
| -0.802500000000068 | 0.896 | 0.448 | 0.299 |
| -0.800000000000068 | 0.9 | 0.45 | 0.3 |
| -0.797500000000068 | 0.904 | 0.452 | 0.301 |
| -0.795000000000068 | 0.908 | 0.454 | 0.303 |
| -0.792500000000068 | 0.913 | 0.456 | 0.304 |
| -0.790000000000068 | 0.917 | 0.458 | 0.306 |
| -0.787500000000068 | 0.921 | 0.461 | 0.307 |
| -0.785000000000068 | 0.925 | 0.463 | 0.308 |
| -0.782500000000069 | 0.93 | 0.465 | 0.31 |
| -0.780000000000069 | 0.934 | 0.467 | 0.311 |
| -0.777500000000069 | 0.938 | 0.469 | 0.313 |
| -0.775000000000069 | 0.943 | 0.471 | 0.314 |
| -0.772500000000069 | 0.947 | 0.474 | 0.316 |
| -0.770000000000069 | 0.952 | 0.476 | 0.317 |
| -0.767500000000069 | 0.956 | 0.478 | 0.319 |
| -0.765000000000069 | 0.961 | 0.481 | 0.32 |
| -0.762500000000069 | 0.966 | 0.483 | 0.322 |
| -0.760000000000069 | 0.97 | 0.485 | 0.323 |
| -0.757500000000069 | 0.975 | 0.488 | 0.325 |
| -0.755000000000069 | 0.98 | 0.49 | 0.327 |
| -0.752500000000069 | 0.985 | 0.492 | 0.328 |
| -0.750000000000069 | 0.989 | 0.495 | 0.33 |
| -0.747500000000069 | 0.994 | 0.497 | 0.331 |
| -0.745000000000069 | 0.999 | 0.5 | 0.333 |
| -0.742500000000069 | 1.004 | 0.502 | 0.335 |
| -0.740000000000069 | 1.009 | 0.505 | 0.336 |
| -0.737500000000069 | 1.014 | 0.507 | 0.338 |
| -0.73500000000007 | 1.019 | 0.51 | 0.34 |
| -0.73250000000007 | 1.024 | 0.512 | 0.341 |
| -0.73000000000007 | 1.03 | 0.515 | 0.343 |
| -0.72750000000007 | 1.035 | 0.517 | 0.345 |
| -0.72500000000007 | 1.04 | 0.52 | 0.347 |
| -0.72250000000007 | 1.045 | 0.523 | 0.348 |
| -0.72000000000007 | 1.051 | 0.525 | 0.35 |
| -0.71750000000007 | 1.056 | 0.528 | 0.352 |
| -0.71500000000007 | 1.062 | 0.531 | 0.354 |
| -0.71250000000007 | 1.067 | 0.534 | 0.356 |
| -0.71000000000007 | 1.073 | 0.536 | 0.358 |
| -0.70750000000007 | 1.079 | 0.539 | 0.36 |
| -0.70500000000007 | 1.084 | 0.542 | 0.361 |
| -0.70250000000007 | 1.09 | 0.545 | 0.363 |
| -0.70000000000007 | 1.096 | 0.548 | 0.365 |
| -0.69750000000007 | 1.102 | 0.551 | 0.367 |
| -0.69500000000007 | 1.108 | 0.554 | 0.369 |
| -0.69250000000007 | 1.114 | 0.557 | 0.371 |
| -0.69000000000007 | 1.12 | 0.56 | 0.373 |
| -0.687500000000071 | 1.126 | 0.563 | 0.375 |
| -0.685000000000071 | 1.132 | 0.566 | 0.377 |
| -0.682500000000071 | 1.138 | 0.569 | 0.379 |
| -0.680000000000071 | 1.145 | 0.572 | 0.382 |
| -0.677500000000071 | 1.151 | 0.576 | 0.384 |
| -0.675000000000071 | 1.158 | 0.579 | 0.386 |
| -0.672500000000071 | 1.164 | 0.582 | 0.388 |
| -0.670000000000071 | 1.171 | 0.585 | 0.39 |
| -0.667500000000071 | 1.177 | 0.589 | 0.392 |
| -0.665000000000071 | 1.184 | 0.592 | 0.395 |
| -0.662500000000071 | 1.191 | 0.596 | 0.397 |
| -0.660000000000071 | 1.198 | 0.599 | 0.399 |
| -0.657500000000071 | 1.205 | 0.602 | 0.402 |
| -0.655000000000071 | 1.212 | 0.606 | 0.404 |
| -0.652500000000071 | 1.219 | 0.61 | 0.406 |
| -0.650000000000071 | 1.226 | 0.613 | 0.409 |
| -0.647500000000071 | 1.234 | 0.617 | 0.411 |
| -0.645000000000071 | 1.241 | 0.621 | 0.414 |
| -0.642500000000071 | 1.249 | 0.624 | 0.416 |
| -0.640000000000072 | 1.256 | 0.628 | 0.419 |
| -0.637500000000072 | 1.264 | 0.632 | 0.421 |
| -0.635000000000072 | 1.272 | 0.636 | 0.424 |
| -0.632500000000072 | 1.28 | 0.64 | 0.427 |
| -0.630000000000072 | 1.288 | 0.644 | 0.429 |
| -0.627500000000072 | 1.296 | 0.648 | 0.432 |
| -0.625000000000072 | 1.304 | 0.652 | 0.435 |
| -0.622500000000072 | 1.312 | 0.656 | 0.437 |
| -0.620000000000072 | 1.321 | 0.66 | 0.44 |
| -0.617500000000072 | 1.329 | 0.665 | 0.443 |
| -0.615000000000072 | 1.338 | 0.669 | 0.446 |
| -0.612500000000072 | 1.347 | 0.673 | 0.449 |
| -0.610000000000072 | 1.356 | 0.678 | 0.452 |
| -0.607500000000072 | 1.365 | 0.682 | 0.455 |
| -0.605000000000072 | 1.374 | 0.687 | 0.458 |
| -0.602500000000072 | 1.383 | 0.691 | 0.461 |
| -0.600000000000072 | 1.392 | 0.696 | 0.464 |
| -0.597500000000073 | 1.402 | 0.701 | 0.467 |
| -0.595000000000073 | 1.412 | 0.706 | 0.471 |
| -0.592500000000073 | 1.421 | 0.711 | 0.474 |
| -0.590000000000073 | 1.431 | 0.716 | 0.477 |
| -0.587500000000073 | 1.442 | 0.721 | 0.481 |
| -0.585000000000073 | 1.452 | 0.726 | 0.484 |
| -0.582500000000073 | 1.462 | 0.731 | 0.487 |
| -0.580000000000073 | 1.473 | 0.736 | 0.491 |
| -0.577500000000073 | 1.484 | 0.742 | 0.495 |
| -0.575000000000073 | 1.495 | 0.747 | 0.498 |
| -0.572500000000073 | 1.506 | 0.753 | 0.502 |
| -0.570000000000073 | 1.517 | 0.758 | 0.506 |
| -0.567500000000073 | 1.528 | 0.764 | 0.509 |
| -0.565000000000073 | 1.54 | 0.77 | 0.513 |
| -0.562500000000073 | 1.552 | 0.776 | 0.517 |
| -0.560000000000073 | 1.564 | 0.782 | 0.521 |
| -0.557500000000073 | 1.576 | 0.788 | 0.525 |
| -0.555000000000073 | 1.589 | 0.794 | 0.53 |
| -0.552500000000073 | 1.602 | 0.801 | 0.534 |
| -0.550000000000074 | 1.615 | 0.807 | 0.538 |
| -0.547500000000074 | 1.628 | 0.814 | 0.543 |
| -0.545000000000074 | 1.641 | 0.821 | 0.547 |
| -0.542500000000074 | 1.655 | 0.827 | 0.552 |
| -0.540000000000074 | 1.669 | 0.834 | 0.556 |
| -0.537500000000074 | 1.683 | 0.842 | 0.561 |
| -0.535000000000074 | 1.698 | 0.849 | 0.566 |
| -0.532500000000074 | 1.712 | 0.856 | 0.571 |
| -0.530000000000074 | 1.728 | 0.864 | 0.576 |
| -0.527500000000074 | 1.743 | 0.871 | 0.581 |
| -0.525000000000074 | 1.759 | 0.879 | 0.586 |
| -0.522500000000074 | 1.775 | 0.887 | 0.592 |
| -0.520000000000074 | 1.791 | 0.896 | 0.597 |
| -0.517500000000074 | 1.808 | 0.904 | 0.603 |
| -0.515000000000074 | 1.825 | 0.913 | 0.608 |
| -0.512500000000074 | 1.843 | 0.921 | 0.614 |
| -0.510000000000074 | 1.861 | 0.93 | 0.62 |
| -0.507500000000074 | 1.879 | 0.939 | 0.626 |
| -0.505000000000074 | 1.898 | 0.949 | 0.633 |
| -0.502500000000075 | 1.917 | 0.959 | 0.639 |
| -0.500000000000075 | 1.937 | 0.968 | 0.646 |
| -0.497500000000075 | 1.957 | 0.979 | 0.652 |
| -0.495000000000075 | 1.978 | 0.989 | 0.659 |
| -0.492500000000075 | 1.999 | 1 | 0.666 |
| -0.490000000000075 | 2.021 | 1.011 | 0.674 |
| -0.487500000000075 | 2.044 | 1.022 | 0.681 |
| -0.485000000000075 | 2.067 | 1.033 | 0.689 |
| -0.482500000000075 | 2.091 | 1.045 | 0.697 |
| -0.480000000000075 | 2.115 | 1.057 | 0.705 |
| -0.477500000000075 | 2.14 | 1.07 | 0.713 |
| -0.475000000000075 | 2.166 | 1.083 | 0.722 |
| -0.472500000000075 | 2.193 | 1.097 | 0.731 |
| -0.470000000000075 | 2.221 | 1.11 | 0.74 |
| -0.467500000000075 | 2.249 | 1.125 | 0.75 |
| -0.465000000000075 | 2.279 | 1.139 | 0.76 |
| -0.462500000000075 | 2.309 | 1.155 | 0.77 |
| -0.460000000000075 | 2.341 | 1.171 | 0.78 |
| -0.457500000000075 | 2.374 | 1.187 | 0.791 |
| -0.455000000000075 | 2.408 | 1.204 | 0.803 |
| -0.452500000000075 | 2.444 | 1.222 | 0.815 |
| -0.450000000000075 | 2.481 | 1.24 | 0.827 |
| -0.447500000000075 | 2.519 | 1.26 | 0.84 |
| -0.445000000000075 | 2.559 | 1.28 | 0.853 |
| -0.442500000000075 | 2.601 | 1.301 | 0.867 |
| -0.440000000000075 | 2.645 | 1.322 | 0.882 |
| -0.437500000000075 | 2.691 | 1.346 | 0.897 |
| -0.435000000000075 | 2.739 | 1.37 | 0.913 |
| -0.432500000000075 | 2.79 | 1.395 | 0.93 |
| -0.430000000000075 | 2.844 | 1.422 | 0.948 |
| -0.427500000000075 | 2.901 | 1.451 | 0.967 |
| -0.425000000000075 | 2.962 | 1.481 | 0.987 |
| -0.422500000000075 | 3.026 | 1.513 | 1.009 |
| -0.420000000000075 | 3.095 | 1.547 | 1.032 |
| -0.417500000000075 | 3.169 | 1.584 | 1.056 |
| -0.415000000000075 | 3.248 | 1.624 | 1.083 |
| -0.412500000000075 | 3.334 | 1.667 | 1.111 |
| -0.410000000000075 | 3.429 | 1.714 | 1.143 |
| -0.407500000000075 | 3.532 | 1.766 | 1.177 |
| -0.405000000000074 | 3.647 | 1.823 | 1.216 |
| -0.402500000000074 | 3.775 | 1.888 | 1.258 |
| -0.400000000000074 | 3.921 | 1.961 | 1.307 |
| -0.397500000000074 | 4.09 | 2.045 | 1.363 |
| -0.395000000000074 | 4.289 | 2.145 | 1.43 |
| -0.392500000000074 | 4.532 | 2.266 | 1.511 |
| -0.390000000000074 | 4.843 | 2.422 | 1.614 |
| -0.387500000000074 | 5.274 | 2.637 | 1.758 |
| -0.385000000000074 | 5.971 | 2.985 | 1.99 |
| -0.382500000000074 | 7.999 | 3.999 | 2.666 |
| -0.380000000000074 | 6.466 | 3.233 | 2.155 |
| -0.377500000000074 | 5.499 | 2.75 | 1.833 |
| -0.375000000000074 | 4.972 | 2.486 | 1.657 |
| -0.372500000000074 | 4.607 | 2.303 | 1.536 |
| -0.370000000000074 | 4.326 | 2.163 | 1.442 |
| -0.367500000000074 | 4.097 | 2.049 | 1.366 |
| -0.365000000000074 | 3.904 | 1.952 | 1.301 |
| -0.362500000000074 | 3.736 | 1.868 | 1.245 |
| -0.360000000000074 | 3.588 | 1.794 | 1.196 |
| -0.357500000000074 | 3.455 | 1.727 | 1.152 |
| -0.355000000000074 | 3.334 | 1.667 | 1.111 |
| -0.352500000000074 | 3.224 | 1.612 | 1.075 |
| -0.350000000000074 | 3.121 | 1.561 | 1.04 |
| -0.347500000000074 | 3.026 | 1.513 | 1.009 |
| -0.345000000000074 | 2.937 | 1.469 | 0.979 |
| -0.342500000000074 | 2.853 | 1.427 | 0.951 |
| -0.340000000000074 | 2.774 | 1.387 | 0.925 |
| -0.337500000000074 | 2.699 | 1.35 | 0.9 |
| -0.335000000000074 | 2.628 | 1.314 | 0.876 |
| -0.332500000000074 | 2.56 | 1.28 | 0.853 |
| -0.330000000000074 | 2.495 | 1.248 | 0.832 |
| -0.327500000000074 | 2.433 | 1.216 | 0.811 |
| -0.325000000000074 | 2.373 | 1.186 | 0.791 |
| -0.322500000000074 | 2.315 | 1.157 | 0.772 |
| -0.320000000000074 | 2.259 | 1.129 | 0.753 |
| -0.317500000000074 | 2.205 | 1.102 | 0.735 |
| -0.315000000000074 | 2.153 | 1.076 | 0.718 |
| -0.312500000000074 | 2.102 | 1.051 | 0.701 |
| -0.310000000000074 | 2.053 | 1.026 | 0.684 |
| -0.307500000000074 | 2.005 | 1.002 | 0.668 |
| -0.305000000000074 | 1.958 | 0.979 | 0.653 |
| -0.302500000000074 | 1.913 | 0.956 | 0.638 |
| -0.300000000000074 | 1.868 | 0.934 | 0.623 |
| -0.297500000000074 | 1.825 | 0.913 | 0.608 |
| -0.295000000000074 | 1.783 | 0.891 | 0.594 |
| -0.292500000000074 | 1.741 | 0.871 | 0.58 |
| -0.290000000000074 | 1.7 | 0.85 | 0.567 |
| -0.287500000000074 | 1.661 | 0.83 | 0.554 |
| -0.285000000000074 | 1.621 | 0.811 | 0.54 |
| -0.282500000000074 | 1.583 | 0.792 | 0.528 |
| -0.280000000000074 | 1.545 | 0.773 | 0.515 |
| -0.277500000000074 | 1.508 | 0.754 | 0.503 |
| -0.275000000000074 | 1.472 | 0.736 | 0.491 |
| -0.272500000000074 | 1.436 | 0.718 | 0.479 |
| -0.270000000000074 | 1.4 | 0.7 | 0.467 |
| -0.267500000000074 | 1.365 | 0.683 | 0.455 |
| -0.265000000000074 | 1.331 | 0.665 | 0.444 |
| -0.262500000000074 | 1.297 | 0.648 | 0.432 |
| -0.260000000000074 | 1.263 | 0.631 | 0.421 |
| -0.257500000000074 | 1.23 | 0.615 | 0.41 |
| -0.255000000000074 | 1.197 | 0.598 | 0.399 |
| -0.252500000000074 | 1.164 | 0.582 | 0.388 |
| -0.250000000000074 | 1.132 | 0.566 | 0.377 |
| -0.247500000000074 | 1.1 | 0.55 | 0.367 |
| -0.245000000000074 | 1.069 | 0.534 | 0.356 |
| -0.242500000000074 | 1.037 | 0.519 | 0.346 |
| -0.240000000000074 | 1.006 | 0.503 | 0.335 |
| -0.237500000000074 | 0.976 | 0.488 | 0.325 |
| -0.235000000000074 | 0.945 | 0.473 | 0.315 |
| -0.232500000000074 | 0.915 | 0.458 | 0.305 |
| -0.230000000000074 | 0.885 | 0.442 | 0.295 |
| -0.227500000000074 | 0.855 | 0.428 | 0.285 |
| -0.225000000000074 | 0.825 | 0.413 | 0.275 |
| -0.222500000000074 | 0.796 | 0.398 | 0.265 |
| -0.220000000000074 | 0.767 | 0.383 | 0.256 |
| -0.217500000000074 | 0.737 | 0.369 | 0.246 |
| -0.215000000000074 | 0.708 | 0.354 | 0.236 |
| -0.212500000000074 | 0.679 | 0.34 | 0.226 |
| -0.210000000000074 | 0.651 | 0.325 | 0.217 |
| -0.207500000000074 | 0.622 | 0.311 | 0.207 |
| -0.205000000000074 | 0.593 | 0.297 | 0.198 |
| -0.202500000000074 | 0.565 | 0.282 | 0.188 |
| -0.200000000000074 | 0.536 | 0.268 | 0.179 |
| -0.197500000000074 | 0.508 | 0.254 | 0.169 |
| -0.195000000000074 | 0.48 | 0.24 | 0.16 |
| -0.192500000000074 | 0.451 | 0.226 | 0.15 |
| -0.190000000000074 | 0.423 | 0.212 | 0.141 |
| -0.187500000000074 | 0.395 | 0.197 | 0.132 |
| -0.185000000000074 | 0.367 | 0.183 | 0.122 |
| -0.182500000000074 | 0.339 | 0.169 | 0.113 |
| -0.180000000000074 | 0.31 | 0.155 | 0.103 |
| -0.177500000000074 | 0.282 | 0.141 | 0.094 |
| -0.175000000000074 | 0.254 | 0.127 | 0.085 |
| -0.172500000000074 | 0.226 | 0.113 | 0.075 |
| -0.170000000000074 | 0.197 | 0.099 | 0.066 |
| -0.167500000000074 | 0.169 | 0.084 | 0.056 |
| -0.165000000000074 | 0.141 | 0.07 | 0.047 |
| -0.162500000000074 | 0.112 | 0.056 | 0.037 |
| -0.160000000000074 | 0.083 | 0.042 | 0.028 |
| -0.157500000000074 | 0.055 | 0.027 | 0.018 |
| -0.155000000000074 | 0.026 | 0.013 | 0.009 |
| -0.152500000000074 | -0.003 | -0.001 | -0.001 |
| -0.150000000000074 | -0.032 | -0.016 | -0.011 |
| -0.147500000000074 | -0.061 | -0.031 | -0.02 |
| -0.145000000000074 | -0.091 | -0.045 | -0.03 |
| -0.142500000000074 | -0.12 | -0.06 | -0.04 |
| -0.140000000000074 | -0.15 | -0.075 | -0.05 |
| -0.137500000000074 | -0.18 | -0.09 | -0.06 |
| -0.135000000000074 | -0.21 | -0.105 | -0.07 |
| -0.132500000000074 | -0.24 | -0.12 | -0.08 |
| -0.130000000000074 | -0.271 | -0.135 | -0.09 |
| -0.127500000000074 | -0.301 | -0.151 | -0.1 |
| -0.125000000000074 | -0.332 | -0.166 | -0.111 |
| -0.122500000000074 | -0.364 | -0.182 | -0.121 |
| -0.120000000000074 | -0.396 | -0.198 | -0.132 |
| -0.117500000000074 | -0.428 | -0.214 | -0.143 |
| -0.115000000000074 | -0.46 | -0.23 | -0.153 |
| -0.112500000000074 | -0.493 | -0.246 | -0.164 |
| -0.110000000000074 | -0.526 | -0.263 | -0.175 |
| -0.107500000000074 | -0.559 | -0.28 | -0.186 |
| -0.105000000000074 | -0.593 | -0.297 | -0.198 |
| -0.102500000000074 | -0.628 | -0.314 | -0.209 |
| -0.100000000000074 | -0.663 | -0.331 | -0.221 |
| -0.0975000000000742 | -0.698 | -0.349 | -0.233 |
| -0.0950000000000742 | -0.734 | -0.367 | -0.245 |
| -0.0925000000000742 | -0.771 | -0.385 | -0.257 |
| -0.0900000000000742 | -0.808 | -0.404 | -0.269 |
| -0.0875000000000742 | -0.846 | -0.423 | -0.282 |
| -0.0850000000000742 | -0.885 | -0.442 | -0.295 |
| -0.0825000000000742 | -0.924 | -0.462 | -0.308 |
| -0.0800000000000742 | -0.965 | -0.482 | -0.322 |
| -0.0775000000000742 | -1.006 | -0.503 | -0.335 |
| -0.0750000000000742 | -1.048 | -0.524 | -0.349 |
| -0.0725000000000742 | -1.091 | -0.546 | -0.364 |
| -0.0700000000000742 | -1.136 | -0.568 | -0.379 |
| -0.0675000000000742 | -1.181 | -0.591 | -0.394 |
| -0.0650000000000742 | -1.228 | -0.614 | -0.409 |
| -0.0625000000000742 | -1.276 | -0.638 | -0.425 |
| -0.0600000000000742 | -1.326 | -0.663 | -0.442 |
| -0.0575000000000742 | -1.378 | -0.689 | -0.459 |
| -0.0550000000000742 | -1.431 | -0.715 | -0.477 |
| -0.0525000000000742 | -1.486 | -0.743 | -0.495 |
| -0.0500000000000742 | -1.544 | -0.772 | -0.515 |
| -0.0475000000000742 | -1.603 | -0.802 | -0.534 |
| -0.0450000000000742 | -1.666 | -0.833 | -0.555 |
| -0.0425000000000742 | -1.732 | -0.866 | -0.577 |
| -0.0400000000000742 | -1.801 | -0.9 | -0.6 |
| -0.0375000000000742 | -1.874 | -0.937 | -0.625 |
| -0.0350000000000742 | -1.951 | -0.975 | -0.65 |
| -0.0325000000000742 | -2.033 | -1.017 | -0.678 |
| -0.0300000000000742 | -2.122 | -1.061 | -0.707 |
| -0.0275000000000742 | -2.217 | -1.108 | -0.739 |
| -0.0250000000000742 | -2.32 | -1.16 | -0.773 |
| -0.0225000000000742 | -2.433 | -1.217 | -0.811 |
| -0.0200000000000742 | -2.559 | -1.28 | -0.853 |
| -0.0175000000000742 | -2.701 | -1.35 | -0.9 |
| -0.0150000000000742 | -2.863 | -1.431 | -0.954 |
| -0.0125000000000742 | -3.053 | -1.526 | -1.018 |
| -0.0100000000000742 | -3.284 | -1.642 | -1.095 |
| -0.0075000000000742 | -3.579 | -1.789 | -1.193 |
| -0.0050000000000742 | -3.992 | -1.996 | -1.331 |
| -0.0025000000000742 | -4.693 | -2.346 | -1.564 |
| -7.4196725152742e-14 | -28.941 | -14.47 | -9.647 |
| 0.0024999999999258 | -4.708 | -2.354 | -1.569 |
| 0.0049999999999258 | -4.022 | -2.011 | -1.341 |
| 0.0074999999999258 | -3.624 | -1.812 | -1.208 |
| 0.0099999999999258 | -3.344 | -1.672 | -1.115 |
| 0.0124999999999258 | -3.128 | -1.564 | -1.043 |
| 0.0149999999999258 | -2.953 | -1.476 | -0.984 |
| 0.0174999999999258 | -2.806 | -1.403 | -0.935 |
| 0.0199999999999258 | -2.679 | -1.34 | -0.893 |
| 0.0224999999999258 | -2.569 | -1.284 | -0.856 |
| 0.0249999999999258 | -2.47 | -1.235 | -0.823 |
| 0.0274999999999258 | -2.382 | -1.191 | -0.794 |
| 0.0299999999999258 | -2.302 | -1.151 | -0.767 |
| 0.0324999999999258 | -2.229 | -1.114 | -0.743 |
| 0.0349999999999258 | -2.162 | -1.081 | -0.721 |
| 0.0374999999999258 | -2.099 | -1.05 | -0.7 |
| 0.0399999999999258 | -2.042 | -1.021 | -0.681 |
| 0.0424999999999258 | -1.988 | -0.994 | -0.663 |
| 0.0449999999999258 | -1.937 | -0.969 | -0.646 |
| 0.0474999999999258 | -1.89 | -0.945 | -0.63 |
| 0.0499999999999258 | -1.845 | -0.923 | -0.615 |
| 0.0524999999999258 | -1.803 | -0.902 | -0.601 |
| 0.0549999999999258 | -1.763 | -0.882 | -0.588 |
| 0.0574999999999258 | -1.725 | -0.863 | -0.575 |
| 0.0599999999999258 | -1.689 | -0.845 | -0.563 |
| 0.0624999999999258 | -1.655 | -0.827 | -0.552 |
| 0.0649999999999258 | -1.622 | -0.811 | -0.541 |
| 0.0674999999999258 | -1.591 | -0.795 | -0.53 |
| 0.0699999999999258 | -1.561 | -0.78 | -0.52 |
| 0.0724999999999258 | -1.532 | -0.766 | -0.511 |
| 0.0749999999999258 | -1.504 | -0.752 | -0.501 |
| 0.0774999999999258 | -1.478 | -0.739 | -0.493 |
| 0.0799999999999258 | -1.452 | -0.726 | -0.484 |
| 0.0824999999999258 | -1.427 | -0.714 | -0.476 |
| 0.0849999999999258 | -1.404 | -0.702 | -0.468 |
| 0.0874999999999258 | -1.381 | -0.69 | -0.46 |
| 0.0899999999999258 | -1.359 | -0.679 | -0.453 |
| 0.0924999999999258 | -1.337 | -0.669 | -0.446 |
| 0.0949999999999258 | -1.317 | -0.658 | -0.439 |
| 0.0974999999999258 | -1.297 | -0.648 | -0.432 |
| 0.0999999999999258 | -1.277 | -0.639 | -0.426 |
| 0.102499999999926 | -1.258 | -0.629 | -0.419 |
| 0.104999999999926 | -1.24 | -0.62 | -0.413 |
| 0.107499999999926 | -1.223 | -0.611 | -0.408 |
| 0.109999999999926 | -1.205 | -0.603 | -0.402 |
| 0.112499999999926 | -1.189 | -0.594 | -0.396 |
| 0.114999999999926 | -1.172 | -0.586 | -0.391 |
| 0.117499999999926 | -1.157 | -0.578 | -0.386 |
| 0.119999999999926 | -1.141 | -0.571 | -0.38 |
| 0.122499999999926 | -1.126 | -0.563 | -0.375 |
| 0.124999999999926 | -1.112 | -0.556 | -0.371 |
| 0.127499999999926 | -1.098 | -0.549 | -0.366 |
| 0.129999999999926 | -1.084 | -0.542 | -0.361 |
| 0.132499999999926 | -1.07 | -0.535 | -0.357 |
| 0.134999999999926 | -1.057 | -0.529 | -0.352 |
| 0.137499999999926 | -1.044 | -0.522 | -0.348 |
| 0.139999999999926 | -1.032 | -0.516 | -0.344 |
| 0.142499999999926 | -1.019 | -0.51 | -0.34 |
| 0.144999999999926 | -1.007 | -0.504 | -0.336 |
| 0.147499999999926 | -0.996 | -0.498 | -0.332 |
| 0.149999999999926 | -0.984 | -0.492 | -0.328 |
| 0.152499999999926 | -0.973 | -0.487 | -0.324 |
| 0.154999999999926 | -0.962 | -0.481 | -0.321 |
| 0.157499999999926 | -0.951 | -0.476 | -0.317 |
| 0.159999999999926 | -0.941 | -0.47 | -0.314 |
| 0.162499999999926 | -0.931 | -0.465 | -0.31 |
| 0.164999999999926 | -0.921 | -0.46 | -0.307 |
| 0.167499999999926 | -0.911 | -0.455 | -0.304 |
| 0.169999999999926 | -0.901 | -0.451 | -0.3 |
| 0.172499999999926 | -0.892 | -0.446 | -0.297 |
| 0.174999999999926 | -0.882 | -0.441 | -0.294 |
| 0.177499999999926 | -0.873 | -0.437 | -0.291 |
| 0.179999999999926 | -0.864 | -0.432 | -0.288 |
| 0.182499999999926 | -0.856 | -0.428 | -0.285 |
| 0.184999999999926 | -0.847 | -0.423 | -0.282 |
| 0.187499999999926 | -0.839 | -0.419 | -0.28 |
| 0.189999999999926 | -0.83 | -0.415 | -0.277 |
| 0.192499999999926 | -0.822 | -0.411 | -0.274 |
| 0.194999999999926 | -0.814 | -0.407 | -0.271 |
| 0.197499999999926 | -0.806 | -0.403 | -0.269 |
| 0.199999999999926 | -0.799 | -0.399 | -0.266 |
| 0.202499999999926 | -0.791 | -0.396 | -0.264 |
| 0.204999999999926 | -0.784 | -0.392 | -0.261 |
| 0.207499999999926 | -0.776 | -0.388 | -0.259 |
| 0.209999999999926 | -0.769 | -0.385 | -0.256 |
| 0.212499999999926 | -0.762 | -0.381 | -0.254 |
| 0.214999999999926 | -0.755 | -0.378 | -0.252 |
| 0.217499999999926 | -0.748 | -0.374 | -0.249 |
| 0.219999999999926 | -0.742 | -0.371 | -0.247 |
| 0.222499999999926 | -0.735 | -0.368 | -0.245 |
| 0.224999999999926 | -0.729 | -0.364 | -0.243 |
| 0.227499999999926 | -0.722 | -0.361 | -0.241 |
| 0.229999999999926 | -0.716 | -0.358 | -0.239 |
| 0.232499999999926 | -0.71 | -0.355 | -0.237 |
| 0.234999999999926 | -0.704 | -0.352 | -0.235 |
| 0.237499999999926 | -0.698 | -0.349 | -0.233 |
| 0.239999999999926 | -0.692 | -0.346 | -0.231 |
| 0.242499999999926 | -0.686 | -0.343 | -0.229 |
| 0.244999999999926 | -0.68 | -0.34 | -0.227 |
| 0.247499999999926 | -0.675 | -0.337 | -0.225 |
| 0.249999999999926 | -0.669 | -0.335 | -0.223 |
| 0.252499999999926 | -0.664 | -0.332 | -0.221 |
| 0.254999999999926 | -0.658 | -0.329 | -0.219 |
| 0.257499999999926 | -0.653 | -0.326 | -0.218 |
| 0.259999999999926 | -0.648 | -0.324 | -0.216 |
| 0.262499999999926 | -0.642 | -0.321 | -0.214 |
| 0.264999999999926 | -0.637 | -0.319 | -0.212 |
| 0.267499999999926 | -0.632 | -0.316 | -0.211 |
| 0.269999999999926 | -0.627 | -0.314 | -0.209 |
| 0.272499999999926 | -0.622 | -0.311 | -0.207 |
| 0.274999999999926 | -0.618 | -0.309 | -0.206 |
| 0.277499999999926 | -0.613 | -0.306 | -0.204 |
| 0.279999999999926 | -0.608 | -0.304 | -0.203 |
| 0.282499999999926 | -0.604 | -0.302 | -0.201 |
| 0.284999999999926 | -0.599 | -0.3 | -0.2 |
| 0.287499999999926 | -0.595 | -0.297 | -0.198 |
| 0.289999999999926 | -0.59 | -0.295 | -0.197 |
| 0.292499999999926 | -0.586 | -0.293 | -0.195 |
| 0.294999999999926 | -0.581 | -0.291 | -0.194 |
| 0.297499999999926 | -0.577 | -0.289 | -0.192 |
| 0.299999999999926 | -0.573 | -0.286 | -0.191 |
| 0.302499999999926 | -0.569 | -0.284 | -0.19 |
| 0.304999999999926 | -0.565 | -0.282 | -0.188 |
| 0.307499999999926 | -0.561 | -0.28 | -0.187 |
| 0.309999999999926 | -0.557 | -0.278 | -0.186 |
| 0.312499999999926 | -0.553 | -0.276 | -0.184 |
| 0.314999999999926 | -0.549 | -0.274 | -0.183 |
| 0.317499999999926 | -0.545 | -0.272 | -0.182 |
| 0.319999999999926 | -0.541 | -0.271 | -0.18 |
| 0.322499999999926 | -0.537 | -0.269 | -0.179 |
| 0.324999999999926 | -0.534 | -0.267 | -0.178 |
| 0.327499999999926 | -0.53 | -0.265 | -0.177 |
| 0.329999999999926 | -0.526 | -0.263 | -0.175 |
| 0.332499999999926 | -0.523 | -0.261 | -0.174 |
| 0.334999999999926 | -0.519 | -0.26 | -0.173 |
| 0.337499999999926 | -0.516 | -0.258 | -0.172 |
| 0.339999999999926 | -0.512 | -0.256 | -0.171 |
| 0.342499999999926 | -0.509 | -0.254 | -0.17 |
| 0.344999999999926 | -0.505 | -0.253 | -0.168 |
| 0.347499999999926 | -0.502 | -0.251 | -0.167 |
| 0.349999999999926 | -0.499 | -0.249 | -0.166 |
| 0.352499999999926 | -0.495 | -0.248 | -0.165 |
| 0.354999999999926 | -0.492 | -0.246 | -0.164 |
| 0.357499999999926 | -0.489 | -0.244 | -0.163 |
| 0.359999999999926 | -0.486 | -0.243 | -0.162 |
| 0.362499999999926 | -0.483 | -0.241 | -0.161 |
| 0.364999999999926 | -0.48 | -0.24 | -0.16 |
| 0.367499999999926 | -0.477 | -0.238 | -0.159 |
| 0.369999999999926 | -0.474 | -0.237 | -0.158 |
| 0.372499999999926 | -0.471 | -0.235 | -0.157 |
| 0.374999999999926 | -0.468 | -0.234 | -0.156 |
| 0.377499999999926 | -0.465 | -0.232 | -0.155 |
| 0.379999999999926 | -0.462 | -0.231 | -0.154 |
| 0.382499999999926 | -0.459 | -0.229 | -0.153 |
| 0.384999999999926 | -0.456 | -0.228 | -0.152 |
| 0.387499999999926 | -0.453 | -0.227 | -0.151 |
| 0.389999999999926 | -0.45 | -0.225 | -0.15 |
| 0.392499999999926 | -0.448 | -0.224 | -0.149 |
| 0.394999999999926 | -0.445 | -0.222 | -0.148 |
| 0.397499999999926 | -0.442 | -0.221 | -0.147 |
| 0.399999999999926 | -0.44 | -0.22 | -0.147 |
| 0.402499999999926 | -0.437 | -0.219 | -0.146 |
| 0.404999999999926 | -0.434 | -0.217 | -0.145 |
| 0.407499999999926 | -0.432 | -0.216 | -0.144 |
| 0.409999999999926 | -0.429 | -0.215 | -0.143 |
| 0.412499999999926 | -0.427 | -0.213 | -0.142 |
| 0.414999999999926 | -0.424 | -0.212 | -0.141 |
| 0.417499999999926 | -0.422 | -0.211 | -0.141 |
| 0.419999999999926 | -0.419 | -0.21 | -0.14 |
| 0.422499999999926 | -0.417 | -0.208 | -0.139 |
| 0.424999999999926 | -0.414 | -0.207 | -0.138 |
| 0.427499999999926 | -0.412 | -0.206 | -0.137 |
| 0.429999999999926 | -0.41 | -0.205 | -0.137 |
| 0.432499999999926 | -0.407 | -0.204 | -0.136 |
| 0.434999999999926 | -0.405 | -0.203 | -0.135 |
| 0.437499999999926 | -0.403 | -0.201 | -0.134 |
| 0.439999999999926 | -0.4 | -0.2 | -0.133 |
| 0.442499999999926 | -0.398 | -0.199 | -0.133 |
| 0.444999999999926 | -0.396 | -0.198 | -0.132 |
| 0.447499999999926 | -0.394 | -0.197 | -0.131 |
| 0.449999999999926 | -0.392 | -0.196 | -0.131 |
| 0.452499999999926 | -0.389 | -0.195 | -0.13 |
| 0.454999999999926 | -0.387 | -0.194 | -0.129 |
| 0.457499999999926 | -0.385 | -0.193 | -0.128 |
| 0.459999999999926 | -0.383 | -0.192 | -0.128 |
| 0.462499999999926 | -0.381 | -0.19 | -0.127 |
| 0.464999999999926 | -0.379 | -0.189 | -0.126 |
| 0.467499999999926 | -0.377 | -0.188 | -0.126 |
| 0.469999999999926 | -0.375 | -0.187 | -0.125 |
| 0.472499999999926 | -0.373 | -0.186 | -0.124 |
| 0.474999999999926 | -0.371 | -0.185 | -0.124 |
| 0.477499999999926 | -0.369 | -0.184 | -0.123 |
| 0.479999999999926 | -0.367 | -0.183 | -0.122 |
| 0.482499999999926 | -0.365 | -0.182 | -0.122 |
| 0.484999999999926 | -0.363 | -0.182 | -0.121 |
| 0.487499999999926 | -0.361 | -0.181 | -0.12 |
| 0.489999999999926 | -0.359 | -0.18 | -0.12 |
| 0.492499999999926 | -0.357 | -0.179 | -0.119 |
| 0.494999999999926 | -0.356 | -0.178 | -0.119 |
| 0.497499999999926 | -0.354 | -0.177 | -0.118 |
| 0.499999999999926 | -0.352 | -0.176 | -0.117 |
| 0.502499999999926 | -0.35 | -0.175 | -0.117 |
| 0.504999999999926 | -0.348 | -0.174 | -0.116 |
| 0.507499999999926 | -0.346 | -0.173 | -0.115 |
| 0.509999999999926 | -0.345 | -0.172 | -0.115 |
| 0.512499999999926 | -0.343 | -0.171 | -0.114 |
| 0.514999999999926 | -0.341 | -0.171 | -0.114 |
| 0.517499999999926 | -0.339 | -0.17 | -0.113 |
| 0.519999999999926 | -0.338 | -0.169 | -0.113 |
| 0.522499999999926 | -0.336 | -0.168 | -0.112 |
| 0.524999999999926 | -0.334 | -0.167 | -0.111 |
| 0.527499999999926 | -0.333 | -0.166 | -0.111 |
| 0.529999999999926 | -0.331 | -0.166 | -0.11 |
| 0.532499999999925 | -0.329 | -0.165 | -0.11 |
| 0.534999999999925 | -0.328 | -0.164 | -0.109 |
| 0.537499999999925 | -0.326 | -0.163 | -0.109 |
| 0.539999999999925 | -0.325 | -0.162 | -0.108 |
| 0.542499999999925 | -0.323 | -0.162 | -0.108 |
| 0.544999999999925 | -0.321 | -0.161 | -0.107 |
| 0.547499999999925 | -0.32 | -0.16 | -0.107 |
| 0.549999999999925 | -0.318 | -0.159 | -0.106 |
| 0.552499999999925 | -0.317 | -0.158 | -0.106 |
| 0.554999999999925 | -0.315 | -0.158 | -0.105 |
| 0.557499999999925 | -0.314 | -0.157 | -0.105 |
| 0.559999999999925 | -0.312 | -0.156 | -0.104 |
| 0.562499999999925 | -0.311 | -0.155 | -0.104 |
| 0.564999999999925 | -0.309 | -0.155 | -0.103 |
| 0.567499999999925 | -0.308 | -0.154 | -0.103 |
| 0.569999999999925 | -0.306 | -0.153 | -0.102 |
| 0.572499999999925 | -0.305 | -0.152 | -0.102 |
| 0.574999999999925 | -0.304 | -0.152 | -0.101 |
| 0.577499999999925 | -0.302 | -0.151 | -0.101 |
| 0.579999999999924 | -0.301 | -0.15 | -0.1 |
| 0.582499999999924 | -0.299 | -0.15 | -0.1 |
| 0.584999999999924 | -0.298 | -0.149 | -0.099 |
| 0.587499999999924 | -0.297 | -0.148 | -0.099 |
| 0.589999999999924 | -0.295 | -0.148 | -0.098 |
| 0.592499999999924 | -0.294 | -0.147 | -0.098 |
| 0.594999999999924 | -0.293 | -0.146 | -0.098 |
| 0.597499999999924 | -0.291 | -0.146 | -0.097 |
| 0.599999999999924 | -0.29 | -0.145 | -0.097 |
| 0.602499999999924 | -0.289 | -0.144 | -0.096 |
| 0.604999999999924 | -0.287 | -0.144 | -0.096 |
| 0.607499999999924 | -0.286 | -0.143 | -0.095 |
| 0.609999999999924 | -0.285 | -0.142 | -0.095 |
| 0.612499999999924 | -0.283 | -0.142 | -0.094 |
| 0.614999999999924 | -0.282 | -0.141 | -0.094 |
| 0.617499999999924 | -0.281 | -0.14 | -0.094 |
| 0.619999999999924 | -0.28 | -0.14 | -0.093 |
| 0.622499999999923 | -0.278 | -0.139 | -0.093 |
| 0.624999999999923 | -0.277 | -0.139 | -0.092 |
| 0.627499999999923 | -0.276 | -0.138 | -0.092 |
| 0.629999999999923 | -0.275 | -0.137 | -0.092 |
| 0.632499999999923 | -0.274 | -0.137 | -0.091 |
| 0.634999999999923 | -0.272 | -0.136 | -0.091 |
| 0.637499999999923 | -0.271 | -0.136 | -0.09 |
| 0.639999999999923 | -0.27 | -0.135 | -0.09 |
| 0.642499999999923 | -0.269 | -0.134 | -0.09 |
| 0.644999999999923 | -0.268 | -0.134 | -0.089 |
| 0.647499999999923 | -0.266 | -0.133 | -0.089 |
| 0.649999999999923 | -0.265 | -0.133 | -0.088 |
| 0.652499999999923 | -0.264 | -0.132 | -0.088 |
| 0.654999999999923 | -0.263 | -0.132 | -0.088 |
| 0.657499999999923 | -0.262 | -0.131 | -0.087 |
| 0.659999999999923 | -0.261 | -0.13 | -0.087 |
| 0.662499999999923 | -0.26 | -0.13 | -0.087 |
| 0.664999999999923 | -0.259 | -0.129 | -0.086 |
| 0.667499999999922 | -0.258 | -0.129 | -0.086 |
| 0.669999999999922 | -0.256 | -0.128 | -0.085 |
| 0.672499999999922 | -0.255 | -0.128 | -0.085 |
| 0.674999999999922 | -0.254 | -0.127 | -0.085 |
| 0.677499999999922 | -0.253 | -0.127 | -0.084 |
| 0.679999999999922 | -0.252 | -0.126 | -0.084 |
| 0.682499999999922 | -0.251 | -0.126 | -0.084 |
| 0.684999999999922 | -0.25 | -0.125 | -0.083 |
| 0.687499999999922 | -0.249 | -0.125 | -0.083 |
| 0.689999999999922 | -0.248 | -0.124 | -0.083 |
| 0.692499999999922 | -0.247 | -0.124 | -0.082 |
| 0.694999999999922 | -0.246 | -0.123 | -0.082 |
| 0.697499999999922 | -0.245 | -0.123 | -0.082 |
| 0.699999999999922 | -0.244 | -0.122 | -0.081 |
| 0.702499999999922 | -0.243 | -0.122 | -0.081 |
| 0.704999999999922 | -0.242 | -0.121 | -0.081 |
| 0.707499999999922 | -0.241 | -0.121 | -0.08 |
| 0.709999999999922 | -0.24 | -0.12 | -0.08 |
| 0.712499999999922 | -0.239 | -0.12 | -0.08 |
| 0.714999999999922 | -0.238 | -0.119 | -0.079 |
| 0.717499999999921 | -0.237 | -0.119 | -0.079 |
| 0.719999999999921 | -0.236 | -0.118 | -0.079 |
| 0.722499999999921 | -0.235 | -0.118 | -0.078 |
| 0.724999999999921 | -0.234 | -0.117 | -0.078 |
| 0.727499999999921 | -0.233 | -0.117 | -0.078 |
| 0.729999999999921 | -0.233 | -0.116 | -0.078 |
| 0.732499999999921 | -0.232 | -0.116 | -0.077 |
| 0.734999999999921 | -0.231 | -0.115 | -0.077 |
| 0.737499999999921 | -0.23 | -0.115 | -0.077 |
| 0.739999999999921 | -0.229 | -0.114 | -0.076 |
| 0.742499999999921 | -0.228 | -0.114 | -0.076 |
| 0.744999999999921 | -0.227 | -0.114 | -0.076 |
| 0.747499999999921 | -0.226 | -0.113 | -0.075 |
| 0.749999999999921 | -0.225 | -0.113 | -0.075 |
| 0.752499999999921 | -0.225 | -0.112 | -0.075 |
| 0.754999999999921 | -0.224 | -0.112 | -0.075 |
| 0.757499999999921 | -0.223 | -0.111 | -0.074 |
| 0.759999999999921 | -0.222 | -0.111 | -0.074 |
| 0.76249999999992 | -0.221 | -0.111 | -0.074 |
| 0.76499999999992 | -0.22 | -0.11 | -0.073 |
| 0.76749999999992 | -0.219 | -0.11 | -0.073 |
| 0.76999999999992 | -0.219 | -0.109 | -0.073 |
| 0.77249999999992 | -0.218 | -0.109 | -0.073 |
| 0.77499999999992 | -0.217 | -0.108 | -0.072 |
| 0.77749999999992 | -0.216 | -0.108 | -0.072 |
| 0.77999999999992 | -0.215 | -0.108 | -0.072 |
| 0.78249999999992 | -0.214 | -0.107 | -0.071 |
| 0.78499999999992 | -0.214 | -0.107 | -0.071 |
| 0.78749999999992 | -0.213 | -0.106 | -0.071 |
| 0.78999999999992 | -0.212 | -0.106 | -0.071 |
| 0.79249999999992 | -0.211 | -0.106 | -0.07 |
| 0.79499999999992 | -0.21 | -0.105 | -0.07 |
| 0.79749999999992 | -0.21 | -0.105 | -0.07 |
| 0.79999999999992 | -0.209 | -0.104 | -0.07 |
| 0.80249999999992 | -0.208 | -0.104 | -0.069 |
| 0.80499999999992 | -0.207 | -0.104 | -0.069 |
| 0.80749999999992 | -0.207 | -0.103 | -0.069 |
| 0.80999999999992 | -0.206 | -0.103 | -0.069 |
| 0.812499999999919 | -0.205 | -0.103 | -0.068 |
| 0.814999999999919 | -0.204 | -0.102 | -0.068 |
| 0.817499999999919 | -0.204 | -0.102 | -0.068 |
| 0.819999999999919 | -0.203 | -0.101 | -0.068 |
| 0.822499999999919 | -0.202 | -0.101 | -0.067 |
| 0.824999999999919 | -0.201 | -0.101 | -0.067 |
| 0.827499999999919 | -0.201 | -0.1 | -0.067 |
| 0.829999999999919 | -0.2 | -0.1 | -0.067 |
| 0.832499999999919 | -0.199 | -0.1 | -0.066 |
| 0.834999999999919 | -0.199 | -0.099 | -0.066 |
| 0.837499999999919 | -0.198 | -0.099 | -0.066 |
| 0.839999999999919 | -0.197 | -0.099 | -0.066 |
| 0.842499999999919 | -0.196 | -0.098 | -0.065 |
| 0.844999999999919 | -0.196 | -0.098 | -0.065 |
| 0.847499999999919 | -0.195 | -0.098 | -0.065 |
| 0.849999999999919 | -0.194 | -0.097 | -0.065 |
| 0.852499999999919 | -0.194 | -0.097 | -0.065 |
| 0.854999999999919 | -0.193 | -0.096 | -0.064 |
| 0.857499999999918 | -0.192 | -0.096 | -0.064 |
| 0.859999999999918 | -0.192 | -0.096 | -0.064 |
| 0.862499999999918 | -0.191 | -0.095 | -0.064 |
| 0.864999999999918 | -0.19 | -0.095 | -0.063 |
| 0.867499999999918 | -0.19 | -0.095 | -0.063 |
| 0.869999999999918 | -0.189 | -0.094 | -0.063 |
| 0.872499999999918 | -0.188 | -0.094 | -0.063 |
| 0.874999999999918 | -0.188 | -0.094 | -0.063 |
| 0.877499999999918 | -0.187 | -0.093 | -0.062 |
| 0.879999999999918 | -0.186 | -0.093 | -0.062 |
| 0.882499999999918 | -0.186 | -0.093 | -0.062 |
| 0.884999999999918 | -0.185 | -0.093 | -0.062 |
| 0.887499999999918 | -0.184 | -0.092 | -0.061 |
| 0.889999999999918 | -0.184 | -0.092 | -0.061 |
| 0.892499999999918 | -0.183 | -0.092 | -0.061 |
| 0.894999999999918 | -0.183 | -0.091 | -0.061 |
| 0.897499999999918 | -0.182 | -0.091 | -0.061 |
| 0.899999999999918 | -0.181 | -0.091 | -0.06 |
| 0.902499999999918 | -0.181 | -0.09 | -0.06 |
| 0.904999999999918 | -0.18 | -0.09 | -0.06 |
| 0.907499999999917 | -0.179 | -0.09 | -0.06 |
| 0.909999999999917 | -0.179 | -0.089 | -0.06 |
| 0.912499999999917 | -0.178 | -0.089 | -0.059 |
| 0.914999999999917 | -0.178 | -0.089 | -0.059 |
| 0.917499999999917 | -0.177 | -0.089 | -0.059 |
| 0.919999999999917 | -0.176 | -0.088 | -0.059 |
| 0.922499999999917 | -0.176 | -0.088 | -0.059 |
| 0.924999999999917 | -0.175 | -0.088 | -0.058 |
| 0.927499999999917 | -0.175 | -0.087 | -0.058 |
| 0.929999999999917 | -0.174 | -0.087 | -0.058 |
| 0.932499999999917 | -0.174 | -0.087 | -0.058 |
| 0.934999999999917 | -0.173 | -0.087 | -0.058 |
| 0.937499999999917 | -0.172 | -0.086 | -0.057 |
| 0.939999999999917 | -0.172 | -0.086 | -0.057 |
| 0.942499999999917 | -0.171 | -0.086 | -0.057 |
| 0.944999999999917 | -0.171 | -0.085 | -0.057 |
| 0.947499999999917 | -0.17 | -0.085 | -0.057 |
| 0.949999999999917 | -0.17 | -0.085 | -0.057 |
| 0.952499999999916 | -0.169 | -0.085 | -0.056 |
| 0.954999999999916 | -0.169 | -0.084 | -0.056 |
| 0.957499999999916 | -0.168 | -0.084 | -0.056 |
| 0.959999999999916 | -0.167 | -0.084 | -0.056 |
| 0.962499999999916 | -0.167 | -0.083 | -0.056 |
| 0.964999999999916 | -0.166 | -0.083 | -0.055 |
| 0.967499999999916 | -0.166 | -0.083 | -0.055 |
| 0.969999999999916 | -0.165 | -0.083 | -0.055 |
| 0.972499999999916 | -0.165 | -0.082 | -0.055 |
| 0.974999999999916 | -0.164 | -0.082 | -0.055 |
| 0.977499999999916 | -0.164 | -0.082 | -0.055 |
| 0.979999999999916 | -0.163 | -0.082 | -0.054 |
| 0.982499999999916 | -0.163 | -0.081 | -0.054 |
| 0.984999999999916 | -0.162 | -0.081 | -0.054 |
| 0.987499999999916 | -0.162 | -0.081 | -0.054 |
| 0.989999999999916 | -0.161 | -0.081 | -0.054 |
| 0.992499999999916 | -0.161 | -0.08 | -0.054 |
| 0.994999999999916 | -0.16 | -0.08 | -0.053 |
| 0.997499999999916 | -0.16 | -0.08 | -0.053 |
| 0.999999999999915 | -0.159 | -0.08 | -0.053 |